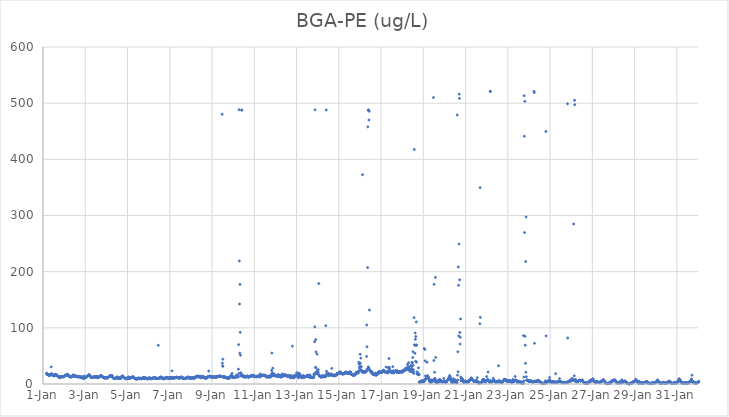
| Category | BGA-PE (ug/L) |
|---|---|
| 44927.166666666664 | 18.65 |
| 44927.177083333336 | 19.18 |
| 44927.1875 | 17.13 |
| 44927.197916666664 | 17.12 |
| 44927.208333333336 | 17.05 |
| 44927.21875 | 17.15 |
| 44927.229166666664 | 16.81 |
| 44927.239583333336 | 16.62 |
| 44927.25 | 16.88 |
| 44927.260416666664 | 15.84 |
| 44927.270833333336 | 16.1 |
| 44927.28125 | 15.01 |
| 44927.291666666664 | 15.62 |
| 44927.302083333336 | 15.47 |
| 44927.3125 | 16.09 |
| 44927.322916666664 | 15.93 |
| 44927.333333333336 | 16.45 |
| 44927.34375 | 15.95 |
| 44927.354166666664 | 16.73 |
| 44927.364583333336 | 16.29 |
| 44927.375 | 17.25 |
| 44927.385416666664 | 30.47 |
| 44927.395833333336 | 18.46 |
| 44927.40625 | 18.08 |
| 44927.416666666664 | 17.68 |
| 44927.427083333336 | 16.64 |
| 44927.4375 | 16.25 |
| 44927.447916666664 | 15.73 |
| 44927.458333333336 | 15.37 |
| 44927.46875 | 15.46 |
| 44927.479166666664 | 15.32 |
| 44927.489583333336 | 15.97 |
| 44927.5 | 15.78 |
| 44927.510416666664 | 13.98 |
| 44927.520833333336 | 15.06 |
| 44927.53125 | 15.73 |
| 44927.541666666664 | 16.14 |
| 44927.552083333336 | 15.03 |
| 44927.5625 | 16.63 |
| 44927.572916666664 | 17.08 |
| 44927.583333333336 | 16.64 |
| 44927.59375 | 17.14 |
| 44927.604166666664 | 16.59 |
| 44927.614583333336 | 15.05 |
| 44927.625 | 14.96 |
| 44927.635416666664 | 15.98 |
| 44927.645833333336 | 15.54 |
| 44927.65625 | 16.41 |
| 44927.666666666664 | 14.56 |
| 44927.677083333336 | 14.66 |
| 44927.6875 | 14.16 |
| 44927.697916666664 | 14.29 |
| 44927.708333333336 | 13.63 |
| 44927.71875 | 13.28 |
| 44927.729166666664 | 13.1 |
| 44927.739583333336 | 12.7 |
| 44927.75 | 12.32 |
| 44927.760416666664 | 12.81 |
| 44927.770833333336 | 12.31 |
| 44927.78125 | 11.78 |
| 44927.791666666664 | 12.26 |
| 44927.802083333336 | 12.34 |
| 44927.8125 | 11.03 |
| 44927.822916666664 | 12.43 |
| 44927.833333333336 | 12.68 |
| 44927.84375 | 12.93 |
| 44927.854166666664 | 12.64 |
| 44927.864583333336 | 13.13 |
| 44927.875 | 12.84 |
| 44927.885416666664 | 13.13 |
| 44927.895833333336 | 13.6 |
| 44927.90625 | 13.12 |
| 44927.916666666664 | 13.04 |
| 44927.927083333336 | 13.09 |
| 44927.9375 | 12.62 |
| 44927.947916666664 | 13.54 |
| 44927.958333333336 | 12.74 |
| 44927.96875 | 13.08 |
| 44927.979166666664 | 13.43 |
| 44927.989583333336 | 13.12 |
| 44928.0 | 12.98 |
| 44928.010416666664 | 13.39 |
| 44928.020833333336 | 14.38 |
| 44928.03125 | 14.74 |
| 44928.041666666664 | 15.17 |
| 44928.052083333336 | 15.42 |
| 44928.0625 | 15.53 |
| 44928.072916666664 | 15.32 |
| 44928.083333333336 | 15.5 |
| 44928.09375 | 15.75 |
| 44928.104166666664 | 16.1 |
| 44928.114583333336 | 16.18 |
| 44928.125 | 16.17 |
| 44928.135416666664 | 16.05 |
| 44928.145833333336 | 16.62 |
| 44928.15625 | 17.14 |
| 44928.166666666664 | 16.83 |
| 44928.177083333336 | 15.29 |
| 44928.1875 | 15.35 |
| 44928.197916666664 | 15.83 |
| 44928.208333333336 | 14.53 |
| 44928.21875 | 14.51 |
| 44928.229166666664 | 14.6 |
| 44928.239583333336 | 13.75 |
| 44928.25 | 13.94 |
| 44928.260416666664 | 13.48 |
| 44928.270833333336 | 13.48 |
| 44928.28125 | 12.92 |
| 44928.291666666664 | 12.66 |
| 44928.302083333336 | 12.52 |
| 44928.3125 | 12.59 |
| 44928.322916666664 | 12.58 |
| 44928.333333333336 | 12.89 |
| 44928.34375 | 12.43 |
| 44928.354166666664 | 13.5 |
| 44928.364583333336 | 13.8 |
| 44928.375 | 13.36 |
| 44928.385416666664 | 13.85 |
| 44928.395833333336 | 13.43 |
| 44928.40625 | 14.41 |
| 44928.416666666664 | 14.92 |
| 44928.427083333336 | 15.25 |
| 44928.4375 | 16.37 |
| 44928.447916666664 | 14 |
| 44928.458333333336 | 14.24 |
| 44928.46875 | 14.18 |
| 44928.479166666664 | 14.22 |
| 44928.489583333336 | 14.66 |
| 44928.5 | 14.39 |
| 44928.510416666664 | 14.44 |
| 44928.520833333336 | 14.01 |
| 44928.53125 | 14.05 |
| 44928.541666666664 | 13.69 |
| 44928.552083333336 | 14.08 |
| 44928.5625 | 14.39 |
| 44928.572916666664 | 13.48 |
| 44928.583333333336 | 13.37 |
| 44928.59375 | 13.19 |
| 44928.604166666664 | 13.55 |
| 44928.614583333336 | 13.35 |
| 44928.625 | 13.06 |
| 44928.635416666664 | 12.7 |
| 44928.645833333336 | 13.03 |
| 44928.65625 | 12.8 |
| 44928.666666666664 | 12.88 |
| 44928.677083333336 | 12.41 |
| 44928.6875 | 13.59 |
| 44928.697916666664 | 13.53 |
| 44928.708333333336 | 13.34 |
| 44928.71875 | 13.3 |
| 44928.729166666664 | 13.03 |
| 44928.739583333336 | 12.75 |
| 44928.75 | 12.69 |
| 44928.760416666664 | 12.42 |
| 44928.770833333336 | 12.17 |
| 44928.78125 | 12.14 |
| 44928.791666666664 | 11.85 |
| 44928.802083333336 | 12.01 |
| 44928.8125 | 12.43 |
| 44928.822916666664 | 12.39 |
| 44928.833333333336 | 11.49 |
| 44928.84375 | 12.12 |
| 44928.854166666664 | 11.93 |
| 44928.864583333336 | 12.15 |
| 44928.875 | 12.36 |
| 44928.885416666664 | 10.09 |
| 44928.895833333336 | 11.67 |
| 44928.90625 | 11.65 |
| 44928.916666666664 | 11.98 |
| 44928.927083333336 | 11.79 |
| 44928.9375 | 9.6 |
| 44928.947916666664 | 14.07 |
| 44928.958333333336 | 11.97 |
| 44928.96875 | 11.89 |
| 44928.979166666664 | 12.26 |
| 44928.989583333336 | 11.67 |
| 44929.0 | 11.66 |
| 44929.010416666664 | 11.88 |
| 44929.020833333336 | 11.72 |
| 44929.03125 | 11.85 |
| 44929.041666666664 | 11.75 |
| 44929.052083333336 | 11.65 |
| 44929.0625 | 12.62 |
| 44929.072916666664 | 13 |
| 44929.083333333336 | 13.63 |
| 44929.09375 | 14 |
| 44929.104166666664 | 14.8 |
| 44929.114583333336 | 14.39 |
| 44929.125 | 14.75 |
| 44929.135416666664 | 15.12 |
| 44929.145833333336 | 15.21 |
| 44929.15625 | 15.79 |
| 44929.166666666664 | 16.57 |
| 44929.177083333336 | 15.92 |
| 44929.1875 | 15.76 |
| 44929.197916666664 | 15.84 |
| 44929.208333333336 | 15.44 |
| 44929.21875 | 14.55 |
| 44929.229166666664 | 14.38 |
| 44929.239583333336 | 12.95 |
| 44929.25 | 13.27 |
| 44929.260416666664 | 12.44 |
| 44929.270833333336 | 12.78 |
| 44929.28125 | 12.28 |
| 44929.291666666664 | 11.9 |
| 44929.302083333336 | 11.91 |
| 44929.3125 | 11.4 |
| 44929.322916666664 | 11.84 |
| 44929.333333333336 | 11.33 |
| 44929.34375 | 11.63 |
| 44929.354166666664 | 11.66 |
| 44929.364583333336 | 11.91 |
| 44929.375 | 11.97 |
| 44929.385416666664 | 12.45 |
| 44929.395833333336 | 12.5 |
| 44929.40625 | 12.63 |
| 44929.416666666664 | 12.84 |
| 44929.427083333336 | 12.88 |
| 44929.4375 | 12.83 |
| 44929.447916666664 | 12.94 |
| 44929.458333333336 | 13.07 |
| 44929.46875 | 12.45 |
| 44929.479166666664 | 12.67 |
| 44929.489583333336 | 12.43 |
| 44929.5 | 12.8 |
| 44929.510416666664 | 12.56 |
| 44929.520833333336 | 12.25 |
| 44929.53125 | 12.21 |
| 44929.541666666664 | 12.01 |
| 44929.552083333336 | 13.2 |
| 44929.5625 | 12.09 |
| 44929.572916666664 | 13.1 |
| 44929.583333333336 | 11.37 |
| 44929.59375 | 11.45 |
| 44929.604166666664 | 11.51 |
| 44929.614583333336 | 11.57 |
| 44929.625 | 12 |
| 44929.635416666664 | 12.16 |
| 44929.645833333336 | 12.48 |
| 44929.65625 | 12.99 |
| 44929.666666666664 | 12.86 |
| 44929.677083333336 | 13.28 |
| 44929.6875 | 13.53 |
| 44929.697916666664 | 13.52 |
| 44929.708333333336 | 13.55 |
| 44929.71875 | 14.55 |
| 44929.729166666664 | 14.64 |
| 44929.739583333336 | 14.56 |
| 44929.75 | 14.76 |
| 44929.760416666664 | 14.5 |
| 44929.770833333336 | 14.5 |
| 44929.78125 | 13.82 |
| 44929.791666666664 | 13.13 |
| 44929.802083333336 | 12.77 |
| 44929.8125 | 12.68 |
| 44929.822916666664 | 12.5 |
| 44929.833333333336 | 12.38 |
| 44929.84375 | 12.14 |
| 44929.854166666664 | 11.52 |
| 44929.864583333336 | 11.76 |
| 44929.875 | 11.9 |
| 44929.885416666664 | 11.18 |
| 44929.895833333336 | 10.81 |
| 44929.90625 | 10.63 |
| 44929.916666666664 | 10.57 |
| 44929.927083333336 | 10.64 |
| 44929.9375 | 11.1 |
| 44929.947916666664 | 11.24 |
| 44929.958333333336 | 11.08 |
| 44929.96875 | 11.15 |
| 44929.979166666664 | 10.8 |
| 44929.989583333336 | 11.62 |
| 44930.0 | 10.84 |
| 44930.010416666664 | 10.91 |
| 44930.020833333336 | 11.46 |
| 44930.03125 | 11.16 |
| 44930.041666666664 | 10.99 |
| 44930.052083333336 | 11.11 |
| 44930.0625 | 11.25 |
| 44930.072916666664 | 11.15 |
| 44930.083333333336 | 11.06 |
| 44930.09375 | 11.92 |
| 44930.104166666664 | 12.62 |
| 44930.114583333336 | 12.88 |
| 44930.125 | 13.44 |
| 44930.135416666664 | 13.64 |
| 44930.145833333336 | 13.6 |
| 44930.15625 | 13.91 |
| 44930.166666666664 | 14.1 |
| 44930.177083333336 | 14.34 |
| 44930.1875 | 14.69 |
| 44930.197916666664 | 14.5 |
| 44930.208333333336 | 14.82 |
| 44930.21875 | 14.65 |
| 44930.229166666664 | 14.37 |
| 44930.239583333336 | 14.43 |
| 44930.25 | 15.09 |
| 44930.260416666664 | 14.45 |
| 44930.270833333336 | 14.56 |
| 44930.28125 | 13.86 |
| 44930.291666666664 | 12.07 |
| 44930.302083333336 | 12.21 |
| 44930.3125 | 11.21 |
| 44930.322916666664 | 10.42 |
| 44930.333333333336 | 10.98 |
| 44930.34375 | 10.54 |
| 44930.354166666664 | 10.15 |
| 44930.364583333336 | 9.94 |
| 44930.375 | 9.74 |
| 44930.385416666664 | 9.69 |
| 44930.395833333336 | 9.86 |
| 44930.40625 | 9.99 |
| 44930.416666666664 | 9.71 |
| 44930.427083333336 | 10.22 |
| 44930.4375 | 10.28 |
| 44930.447916666664 | 10.83 |
| 44930.458333333336 | 10.68 |
| 44930.46875 | 10.94 |
| 44930.479166666664 | 11.15 |
| 44930.489583333336 | 11.3 |
| 44930.5 | 11.19 |
| 44930.510416666664 | 12.93 |
| 44930.520833333336 | 10.7 |
| 44930.53125 | 10.33 |
| 44930.541666666664 | 10.33 |
| 44930.552083333336 | 10.09 |
| 44930.5625 | 10.08 |
| 44930.572916666664 | 9.81 |
| 44930.583333333336 | 10.77 |
| 44930.59375 | 11 |
| 44930.604166666664 | 10.67 |
| 44930.614583333336 | 10.29 |
| 44930.625 | 9.86 |
| 44930.635416666664 | 10.16 |
| 44930.645833333336 | 9.82 |
| 44930.65625 | 11.32 |
| 44930.666666666664 | 11.47 |
| 44930.677083333336 | 11.46 |
| 44930.6875 | 12.46 |
| 44930.697916666664 | 10.06 |
| 44930.708333333336 | 12.18 |
| 44930.71875 | 12.79 |
| 44930.729166666664 | 13.2 |
| 44930.739583333336 | 13.8 |
| 44930.75 | 14.16 |
| 44930.760416666664 | 14.11 |
| 44930.770833333336 | 13.6 |
| 44930.78125 | 14.07 |
| 44930.791666666664 | 12.73 |
| 44930.802083333336 | 12.24 |
| 44930.8125 | 12.52 |
| 44930.822916666664 | 12.12 |
| 44930.833333333336 | 11.13 |
| 44930.84375 | 11.56 |
| 44930.854166666664 | 10.7 |
| 44930.864583333336 | 10.63 |
| 44930.875 | 10.43 |
| 44930.885416666664 | 9.65 |
| 44930.895833333336 | 9.45 |
| 44930.90625 | 9.7 |
| 44930.916666666664 | 9.24 |
| 44930.927083333336 | 9.63 |
| 44930.9375 | 9.63 |
| 44930.947916666664 | 9.35 |
| 44930.958333333336 | 9.89 |
| 44930.96875 | 10.23 |
| 44930.979166666664 | 10.61 |
| 44930.989583333336 | 10.5 |
| 44931.0 | 11.18 |
| 44931.010416666664 | 11.52 |
| 44931.020833333336 | 11.4 |
| 44931.03125 | 10.01 |
| 44931.041666666664 | 10.48 |
| 44931.052083333336 | 12.75 |
| 44931.0625 | 10.58 |
| 44931.072916666664 | 9.98 |
| 44931.083333333336 | 10.04 |
| 44931.09375 | 10.29 |
| 44931.104166666664 | 10.04 |
| 44931.114583333336 | 10.26 |
| 44931.125 | 10.12 |
| 44931.135416666664 | 10.93 |
| 44931.145833333336 | 11.42 |
| 44931.15625 | 11.7 |
| 44931.166666666664 | 11.46 |
| 44931.177083333336 | 11.76 |
| 44931.1875 | 11.46 |
| 44931.197916666664 | 11.95 |
| 44931.208333333336 | 11.65 |
| 44931.21875 | 11.89 |
| 44931.229166666664 | 11.74 |
| 44931.239583333336 | 12.06 |
| 44931.25 | 12.65 |
| 44931.260416666664 | 12.99 |
| 44931.270833333336 | 11.47 |
| 44931.28125 | 11.89 |
| 44931.291666666664 | 11.55 |
| 44931.302083333336 | 11.45 |
| 44931.3125 | 11.28 |
| 44931.322916666664 | 10.49 |
| 44931.333333333336 | 10.36 |
| 44931.34375 | 10.28 |
| 44931.354166666664 | 9.99 |
| 44931.364583333336 | 9.38 |
| 44931.375 | 9.33 |
| 44931.385416666664 | 9.27 |
| 44931.395833333336 | 9.37 |
| 44931.40625 | 9.22 |
| 44931.416666666664 | 9.1 |
| 44931.427083333336 | 9.3 |
| 44931.4375 | 8.99 |
| 44931.447916666664 | 9.35 |
| 44931.458333333336 | 9.17 |
| 44931.46875 | 9.28 |
| 44931.479166666664 | 9.41 |
| 44931.489583333336 | 9.56 |
| 44931.5 | 9.97 |
| 44931.510416666664 | 10.32 |
| 44931.520833333336 | 10.3 |
| 44931.53125 | 10.68 |
| 44931.541666666664 | 9.69 |
| 44931.552083333336 | 9.88 |
| 44931.5625 | 9.61 |
| 44931.572916666664 | 10.37 |
| 44931.583333333336 | 9.34 |
| 44931.59375 | 9.29 |
| 44931.604166666664 | 9.56 |
| 44931.614583333336 | 9.8 |
| 44931.625 | 10.14 |
| 44931.635416666664 | 10.13 |
| 44931.645833333336 | 9.88 |
| 44931.65625 | 9.86 |
| 44931.666666666664 | 9.37 |
| 44931.677083333336 | 10.03 |
| 44931.6875 | 9.9 |
| 44931.697916666664 | 10.23 |
| 44931.708333333336 | 11 |
| 44931.71875 | 10.71 |
| 44931.729166666664 | 10.02 |
| 44931.739583333336 | 10.62 |
| 44931.75 | 11.11 |
| 44931.760416666664 | 10.81 |
| 44931.770833333336 | 11.48 |
| 44931.78125 | 11.94 |
| 44931.791666666664 | 9.79 |
| 44931.802083333336 | 10.89 |
| 44931.8125 | 11.39 |
| 44931.822916666664 | 10.62 |
| 44931.833333333336 | 10.34 |
| 44931.84375 | 10.51 |
| 44931.854166666664 | 10.26 |
| 44931.864583333336 | 9.93 |
| 44931.875 | 9.98 |
| 44931.885416666664 | 10.89 |
| 44931.895833333336 | 9.63 |
| 44931.90625 | 9.62 |
| 44931.916666666664 | 9.37 |
| 44931.927083333336 | 9.34 |
| 44931.9375 | 9.47 |
| 44931.947916666664 | 9.32 |
| 44931.958333333336 | 9.08 |
| 44931.96875 | 9.53 |
| 44931.979166666664 | 9.59 |
| 44931.989583333336 | 9.61 |
| 44932.0 | 9.58 |
| 44932.010416666664 | 9.74 |
| 44932.020833333336 | 9.93 |
| 44932.03125 | 11.76 |
| 44932.041666666664 | 10.85 |
| 44932.052083333336 | 11 |
| 44932.0625 | 10.15 |
| 44932.072916666664 | 9.64 |
| 44932.083333333336 | 9.58 |
| 44932.09375 | 9.47 |
| 44932.104166666664 | 10.23 |
| 44932.114583333336 | 9.96 |
| 44932.125 | 9.87 |
| 44932.135416666664 | 9.77 |
| 44932.145833333336 | 9.43 |
| 44932.15625 | 9.2 |
| 44932.166666666664 | 9.84 |
| 44932.177083333336 | 10.23 |
| 44932.1875 | 10.1 |
| 44932.197916666664 | 10.39 |
| 44932.208333333336 | 10.45 |
| 44932.21875 | 10.41 |
| 44932.229166666664 | 10.84 |
| 44932.239583333336 | 10.77 |
| 44932.25 | 11.01 |
| 44932.260416666664 | 11.08 |
| 44932.270833333336 | 11.06 |
| 44932.28125 | 11.5 |
| 44932.291666666664 | 11.24 |
| 44932.302083333336 | 10.51 |
| 44932.3125 | 11 |
| 44932.322916666664 | 10.38 |
| 44932.333333333336 | 10.35 |
| 44932.34375 | 9.96 |
| 44932.354166666664 | 9.74 |
| 44932.364583333336 | 10.1 |
| 44932.375 | 10.27 |
| 44932.385416666664 | 10.02 |
| 44932.395833333336 | 9.88 |
| 44932.40625 | 9.71 |
| 44932.416666666664 | 9.74 |
| 44932.427083333336 | 9.87 |
| 44932.4375 | 9.82 |
| 44932.447916666664 | 9.95 |
| 44932.458333333336 | 68.88 |
| 44932.46875 | 9.67 |
| 44932.479166666664 | 9.9 |
| 44932.489583333336 | 10.68 |
| 44932.5 | 10.95 |
| 44932.510416666664 | 10.69 |
| 44932.520833333336 | 11.08 |
| 44932.53125 | 11.41 |
| 44932.541666666664 | 10.44 |
| 44932.552083333336 | 12.23 |
| 44932.5625 | 11.37 |
| 44932.572916666664 | 11.58 |
| 44932.583333333336 | 12.57 |
| 44932.59375 | 11.5 |
| 44932.604166666664 | 11.74 |
| 44932.614583333336 | 11.14 |
| 44932.625 | 10.64 |
| 44932.635416666664 | 11.02 |
| 44932.645833333336 | 11.28 |
| 44932.65625 | 9.57 |
| 44932.666666666664 | 9.62 |
| 44932.677083333336 | 9.49 |
| 44932.6875 | 9.34 |
| 44932.697916666664 | 9.83 |
| 44932.708333333336 | 10.7 |
| 44932.71875 | 9.45 |
| 44932.729166666664 | 10.16 |
| 44932.739583333336 | 9.05 |
| 44932.75 | 10.1 |
| 44932.760416666664 | 9.62 |
| 44932.770833333336 | 10.29 |
| 44932.78125 | 10.84 |
| 44932.791666666664 | 10.54 |
| 44932.802083333336 | 9.97 |
| 44932.8125 | 11.53 |
| 44932.822916666664 | 11.5 |
| 44932.833333333336 | 11.83 |
| 44932.84375 | 11.5 |
| 44932.854166666664 | 11.62 |
| 44932.864583333336 | 11.36 |
| 44932.875 | 10.55 |
| 44932.885416666664 | 10.57 |
| 44932.895833333336 | 10.41 |
| 44932.90625 | 10.26 |
| 44932.916666666664 | 10.69 |
| 44932.927083333336 | 10.48 |
| 44932.9375 | 10.85 |
| 44932.947916666664 | 10.55 |
| 44932.958333333336 | 10.57 |
| 44932.96875 | 10.48 |
| 44932.979166666664 | 10.23 |
| 44932.989583333336 | 10.22 |
| 44933.0 | 11.3 |
| 44933.010416666664 | 9.99 |
| 44933.020833333336 | 10.05 |
| 44933.03125 | 10.73 |
| 44933.041666666664 | 10.21 |
| 44933.052083333336 | 10.26 |
| 44933.0625 | 11.02 |
| 44933.072916666664 | 11.85 |
| 44933.083333333336 | 10.81 |
| 44933.09375 | 10.68 |
| 44933.104166666664 | 23.41 |
| 44933.114583333336 | 10.53 |
| 44933.125 | 10.27 |
| 44933.135416666664 | 10.42 |
| 44933.145833333336 | 10.54 |
| 44933.15625 | 10.72 |
| 44933.166666666664 | 10.44 |
| 44933.177083333336 | 10.63 |
| 44933.1875 | 10.47 |
| 44933.197916666664 | 11.9 |
| 44933.208333333336 | 10.75 |
| 44933.21875 | 11.08 |
| 44933.229166666664 | 11.3 |
| 44933.239583333336 | 11.23 |
| 44933.25 | 11.56 |
| 44933.260416666664 | 11.5 |
| 44933.270833333336 | 11.04 |
| 44933.28125 | 11.39 |
| 44933.291666666664 | 11.32 |
| 44933.302083333336 | 11.59 |
| 44933.3125 | 12.26 |
| 44933.322916666664 | 12.1 |
| 44933.333333333336 | 11.73 |
| 44933.34375 | 11.61 |
| 44933.354166666664 | 11.32 |
| 44933.364583333336 | 11.28 |
| 44933.375 | 11.38 |
| 44933.385416666664 | 11.11 |
| 44933.395833333336 | 11.18 |
| 44933.40625 | 11.06 |
| 44933.416666666664 | 10.92 |
| 44933.427083333336 | 10.94 |
| 44933.4375 | 10.95 |
| 44933.447916666664 | 10.56 |
| 44933.458333333336 | 10.49 |
| 44933.46875 | 10.66 |
| 44933.479166666664 | 10.98 |
| 44933.489583333336 | 11.05 |
| 44933.5 | 11.82 |
| 44933.510416666664 | 12 |
| 44933.520833333336 | 11.14 |
| 44933.53125 | 11.88 |
| 44933.541666666664 | 12.01 |
| 44933.552083333336 | 12.55 |
| 44933.5625 | 11.25 |
| 44933.572916666664 | 11.86 |
| 44933.583333333336 | 11.98 |
| 44933.59375 | 10.25 |
| 44933.604166666664 | 11.23 |
| 44933.614583333336 | 9.79 |
| 44933.625 | 10.88 |
| 44933.635416666664 | 10.23 |
| 44933.645833333336 | 10.33 |
| 44933.65625 | 10.01 |
| 44933.666666666664 | 9.85 |
| 44933.677083333336 | 10.08 |
| 44933.6875 | 9.85 |
| 44933.697916666664 | 9.57 |
| 44933.708333333336 | 10.02 |
| 44933.71875 | 9.97 |
| 44933.729166666664 | 9.85 |
| 44933.739583333336 | 9.92 |
| 44933.75 | 10.29 |
| 44933.760416666664 | 10.21 |
| 44933.770833333336 | 10.09 |
| 44933.78125 | 10.63 |
| 44933.791666666664 | 10.54 |
| 44933.802083333336 | 10.43 |
| 44933.8125 | 10.68 |
| 44933.822916666664 | 11.04 |
| 44933.833333333336 | 11.68 |
| 44933.84375 | 12.61 |
| 44933.854166666664 | 12.12 |
| 44933.864583333336 | 11.76 |
| 44933.875 | 12.01 |
| 44933.885416666664 | 11.54 |
| 44933.895833333336 | 11.61 |
| 44933.90625 | 10.16 |
| 44933.916666666664 | 11.1 |
| 44933.927083333336 | 11.08 |
| 44933.9375 | 10.94 |
| 44933.947916666664 | 11.31 |
| 44933.958333333336 | 11.4 |
| 44933.96875 | 10.93 |
| 44933.979166666664 | 9.95 |
| 44933.989583333336 | 10.8 |
| 44934.0 | 10.9 |
| 44934.010416666664 | 10.69 |
| 44934.020833333336 | 10.72 |
| 44934.03125 | 10.7 |
| 44934.041666666664 | 10.73 |
| 44934.052083333336 | 10.46 |
| 44934.0625 | 11.21 |
| 44934.072916666664 | 11.21 |
| 44934.083333333336 | 11.14 |
| 44934.09375 | 11.4 |
| 44934.104166666664 | 11.46 |
| 44934.114583333336 | 10.83 |
| 44934.125 | 10.55 |
| 44934.135416666664 | 10.64 |
| 44934.145833333336 | 9.33 |
| 44934.15625 | 11.44 |
| 44934.166666666664 | 11.28 |
| 44934.177083333336 | 11.94 |
| 44934.1875 | 11.57 |
| 44934.197916666664 | 11.54 |
| 44934.208333333336 | 12.08 |
| 44934.21875 | 12.24 |
| 44934.229166666664 | 12.19 |
| 44934.239583333336 | 13.28 |
| 44934.25 | 12.68 |
| 44934.260416666664 | 12.92 |
| 44934.270833333336 | 13.02 |
| 44934.28125 | 12.95 |
| 44934.291666666664 | 12.84 |
| 44934.302083333336 | 12.75 |
| 44934.3125 | 13.02 |
| 44934.322916666664 | 13.96 |
| 44934.333333333336 | 14.58 |
| 44934.34375 | 13.38 |
| 44934.354166666664 | 13.44 |
| 44934.364583333336 | 13.08 |
| 44934.375 | 12.81 |
| 44934.385416666664 | 12.89 |
| 44934.395833333336 | 13.52 |
| 44934.40625 | 12.88 |
| 44934.416666666664 | 12.4 |
| 44934.427083333336 | 12.45 |
| 44934.4375 | 13.96 |
| 44934.447916666664 | 12.26 |
| 44934.458333333336 | 12.17 |
| 44934.46875 | 12.06 |
| 44934.479166666664 | 11.61 |
| 44934.489583333336 | 11.94 |
| 44934.5 | 10.9 |
| 44934.510416666664 | 10.93 |
| 44934.520833333336 | 12.32 |
| 44934.53125 | 13.02 |
| 44934.541666666664 | 12.55 |
| 44934.552083333336 | 13.49 |
| 44934.5625 | 13.2 |
| 44934.572916666664 | 13.45 |
| 44934.583333333336 | 12.57 |
| 44934.59375 | 12.45 |
| 44934.604166666664 | 12.71 |
| 44934.614583333336 | 12.17 |
| 44934.625 | 11.53 |
| 44934.635416666664 | 11.77 |
| 44934.645833333336 | 11.46 |
| 44934.65625 | 11.88 |
| 44934.666666666664 | 11.42 |
| 44934.677083333336 | 9.81 |
| 44934.6875 | 10.68 |
| 44934.697916666664 | 11.47 |
| 44934.708333333336 | 11.17 |
| 44934.71875 | 10.89 |
| 44934.729166666664 | 11.73 |
| 44934.739583333336 | 11.03 |
| 44934.75 | 10.48 |
| 44934.760416666664 | 11.23 |
| 44934.770833333336 | 11.24 |
| 44934.78125 | 12 |
| 44934.791666666664 | 13.13 |
| 44934.802083333336 | 12.79 |
| 44934.8125 | 12.93 |
| 44934.822916666664 | 13.21 |
| 44934.833333333336 | 12.72 |
| 44934.84375 | 22.98 |
| 44934.854166666664 | 12.93 |
| 44934.864583333336 | 13.2 |
| 44934.875 | 13.52 |
| 44934.885416666664 | 14.04 |
| 44934.895833333336 | 13.44 |
| 44934.90625 | 13.79 |
| 44934.916666666664 | 13.22 |
| 44934.927083333336 | 12.58 |
| 44934.9375 | 12.87 |
| 44934.947916666664 | 12.92 |
| 44934.958333333336 | 12.14 |
| 44934.96875 | 13.23 |
| 44934.979166666664 | 12.11 |
| 44934.989583333336 | 12.3 |
| 44935.0 | 12.84 |
| 44935.010416666664 | 12.09 |
| 44935.020833333336 | 12.89 |
| 44935.03125 | 13.07 |
| 44935.041666666664 | 12.21 |
| 44935.052083333336 | 12.22 |
| 44935.0625 | 12.17 |
| 44935.072916666664 | 12.02 |
| 44935.083333333336 | 12.65 |
| 44935.09375 | 12.6 |
| 44935.104166666664 | 12.93 |
| 44935.114583333336 | 12.62 |
| 44935.125 | 12.83 |
| 44935.135416666664 | 12.15 |
| 44935.145833333336 | 12.09 |
| 44935.15625 | 12.25 |
| 44935.166666666664 | 12.08 |
| 44935.177083333336 | 12.23 |
| 44935.1875 | 11.88 |
| 44935.197916666664 | 12.71 |
| 44935.208333333336 | 13.03 |
| 44935.21875 | 13.05 |
| 44935.229166666664 | 13.34 |
| 44935.239583333336 | 12.55 |
| 44935.25 | 13 |
| 44935.260416666664 | 13.2 |
| 44935.270833333336 | 13.52 |
| 44935.28125 | 13.32 |
| 44935.291666666664 | 13.71 |
| 44935.302083333336 | 13.59 |
| 44935.3125 | 13.15 |
| 44935.322916666664 | 13.73 |
| 44935.333333333336 | 13.8 |
| 44935.34375 | 14.03 |
| 44935.354166666664 | 13.81 |
| 44935.364583333336 | 14.17 |
| 44935.375 | 13.73 |
| 44935.385416666664 | 13.77 |
| 44935.395833333336 | 13.96 |
| 44935.40625 | 13.66 |
| 44935.416666666664 | 13.52 |
| 44935.427083333336 | 12.9 |
| 44935.4375 | 13.13 |
| 44935.447916666664 | 13.08 |
| 44935.458333333336 | 13.01 |
| 44935.46875 | 12.99 |
| 44935.479166666664 | 480.24 |
| 44935.489583333336 | 36.94 |
| 44935.5 | 32.15 |
| 44935.510416666664 | 44.05 |
| 44935.520833333336 | 31.55 |
| 44935.53125 | 13.49 |
| 44935.541666666664 | 12 |
| 44935.552083333336 | 11.96 |
| 44935.5625 | 12.42 |
| 44935.572916666664 | 11.48 |
| 44935.583333333336 | 13.13 |
| 44935.59375 | 13.11 |
| 44935.604166666664 | 12.68 |
| 44935.614583333336 | 11.82 |
| 44935.625 | 11.77 |
| 44935.635416666664 | 11.6 |
| 44935.645833333336 | 11.26 |
| 44935.65625 | 11.48 |
| 44935.666666666664 | 11.38 |
| 44935.677083333336 | 11.75 |
| 44935.6875 | 10.83 |
| 44935.697916666664 | 10.74 |
| 44935.708333333336 | 11.07 |
| 44935.71875 | 10.81 |
| 44935.729166666664 | 10.17 |
| 44935.739583333336 | 10.41 |
| 44935.75 | 10.55 |
| 44935.760416666664 | 10.54 |
| 44935.770833333336 | 10.88 |
| 44935.78125 | 10.51 |
| 44935.791666666664 | 10.49 |
| 44935.802083333336 | 10.47 |
| 44935.8125 | 10.96 |
| 44935.822916666664 | 11.31 |
| 44935.833333333336 | 11.39 |
| 44935.84375 | 12.22 |
| 44935.854166666664 | 12.77 |
| 44935.864583333336 | 12.97 |
| 44935.875 | 13.14 |
| 44935.885416666664 | 13.32 |
| 44935.895833333336 | 13.58 |
| 44935.90625 | 12.6 |
| 44935.916666666664 | 16.3 |
| 44935.927083333336 | 13.85 |
| 44935.9375 | 14.51 |
| 44935.947916666664 | 18.86 |
| 44935.958333333336 | 13.12 |
| 44935.96875 | 11.98 |
| 44935.979166666664 | 11.93 |
| 44935.989583333336 | 12.66 |
| 44936.0 | 11.88 |
| 44936.010416666664 | 11.86 |
| 44936.020833333336 | 12.32 |
| 44936.03125 | 11.68 |
| 44936.041666666664 | 12.17 |
| 44936.052083333336 | 11.74 |
| 44936.0625 | 11.82 |
| 44936.072916666664 | 11.48 |
| 44936.083333333336 | 11.8 |
| 44936.09375 | 11.89 |
| 44936.104166666664 | 12.55 |
| 44936.114583333336 | 12.92 |
| 44936.125 | 12.55 |
| 44936.135416666664 | 13.42 |
| 44936.145833333336 | 14.51 |
| 44936.15625 | 15.09 |
| 44936.166666666664 | 15.83 |
| 44936.177083333336 | 12.77 |
| 44936.1875 | 12.86 |
| 44936.197916666664 | 12.89 |
| 44936.208333333336 | 13.61 |
| 44936.21875 | 12.25 |
| 44936.229166666664 | 12.68 |
| 44936.239583333336 | 13.03 |
| 44936.25 | 26.39 |
| 44936.260416666664 | 70.12 |
| 44936.270833333336 | 18.69 |
| 44936.28125 | 488.32 |
| 44936.291666666664 | 219.14 |
| 44936.302083333336 | 142.41 |
| 44936.3125 | 54.92 |
| 44936.322916666664 | 177.37 |
| 44936.333333333336 | 91.98 |
| 44936.34375 | 51.21 |
| 44936.354166666664 | 14.62 |
| 44936.364583333336 | 20.11 |
| 44936.375 | 18.87 |
| 44936.385416666664 | 15.91 |
| 44936.395833333336 | 14.72 |
| 44936.40625 | 487.56 |
| 44936.416666666664 | 487.64 |
| 44936.427083333336 | 14.01 |
| 44936.4375 | 14.17 |
| 44936.447916666664 | 14.03 |
| 44936.458333333336 | 13.63 |
| 44936.46875 | 14.27 |
| 44936.479166666664 | 13.24 |
| 44936.489583333336 | 13.74 |
| 44936.5 | 14.99 |
| 44936.510416666664 | 13.62 |
| 44936.520833333336 | 12.28 |
| 44936.53125 | 13.38 |
| 44936.541666666664 | 13.67 |
| 44936.552083333336 | 13.71 |
| 44936.5625 | 12.6 |
| 44936.572916666664 | 12.79 |
| 44936.583333333336 | 12.2 |
| 44936.59375 | 13.18 |
| 44936.604166666664 | 12.6 |
| 44936.614583333336 | 13 |
| 44936.625 | 12.82 |
| 44936.635416666664 | 13.28 |
| 44936.645833333336 | 13.27 |
| 44936.65625 | 14.34 |
| 44936.666666666664 | 13.92 |
| 44936.677083333336 | 13.95 |
| 44936.6875 | 13.58 |
| 44936.697916666664 | 12.91 |
| 44936.708333333336 | 12.05 |
| 44936.71875 | 11.93 |
| 44936.729166666664 | 12.95 |
| 44936.739583333336 | 12.4 |
| 44936.75 | 13.9 |
| 44936.760416666664 | 13.55 |
| 44936.770833333336 | 13.09 |
| 44936.78125 | 12.79 |
| 44936.791666666664 | 13.02 |
| 44936.802083333336 | 13.4 |
| 44936.8125 | 13.87 |
| 44936.822916666664 | 14.16 |
| 44936.833333333336 | 14.16 |
| 44936.84375 | 13.85 |
| 44936.854166666664 | 14.86 |
| 44936.864583333336 | 14.82 |
| 44936.875 | 14.96 |
| 44936.885416666664 | 14.77 |
| 44936.895833333336 | 15.17 |
| 44936.90625 | 15.69 |
| 44936.916666666664 | 14.73 |
| 44936.927083333336 | 14.32 |
| 44936.9375 | 14.31 |
| 44936.947916666664 | 14.68 |
| 44936.958333333336 | 14.3 |
| 44936.96875 | 14.46 |
| 44936.979166666664 | 14.49 |
| 44936.989583333336 | 13.71 |
| 44937.0 | 14.17 |
| 44937.010416666664 | 14.06 |
| 44937.020833333336 | 13.27 |
| 44937.03125 | 13.24 |
| 44937.041666666664 | 13.69 |
| 44937.052083333336 | 13.03 |
| 44937.0625 | 13.49 |
| 44937.072916666664 | 13 |
| 44937.083333333336 | 12.75 |
| 44937.09375 | 12.74 |
| 44937.104166666664 | 13.05 |
| 44937.114583333336 | 13.16 |
| 44937.125 | 13.48 |
| 44937.135416666664 | 13.2 |
| 44937.145833333336 | 13.32 |
| 44937.15625 | 13.51 |
| 44937.166666666664 | 13.69 |
| 44937.177083333336 | 14.24 |
| 44937.1875 | 14.5 |
| 44937.197916666664 | 13.32 |
| 44937.208333333336 | 13.38 |
| 44937.21875 | 13.3 |
| 44937.229166666664 | 14.18 |
| 44937.239583333336 | 13.49 |
| 44937.25 | 13.45 |
| 44937.260416666664 | 13.28 |
| 44937.270833333336 | 12.24 |
| 44937.28125 | 17.88 |
| 44937.291666666664 | 13.52 |
| 44937.302083333336 | 14.57 |
| 44937.3125 | 14.7 |
| 44937.322916666664 | 14.97 |
| 44937.333333333336 | 15.06 |
| 44937.34375 | 15.31 |
| 44937.354166666664 | 15 |
| 44937.364583333336 | 15.06 |
| 44937.375 | 15.07 |
| 44937.385416666664 | 15.64 |
| 44937.395833333336 | 15.63 |
| 44937.40625 | 15.82 |
| 44937.416666666664 | 15.59 |
| 44937.427083333336 | 15.18 |
| 44937.4375 | 15.52 |
| 44937.447916666664 | 14.9 |
| 44937.458333333336 | 14.78 |
| 44937.46875 | 14.87 |
| 44937.479166666664 | 16.16 |
| 44937.489583333336 | 14.41 |
| 44937.5 | 15.16 |
| 44937.510416666664 | 15.09 |
| 44937.520833333336 | 14.81 |
| 44937.53125 | 14.85 |
| 44937.541666666664 | 14.39 |
| 44937.552083333336 | 14.64 |
| 44937.5625 | 13.54 |
| 44937.572916666664 | 13.56 |
| 44937.583333333336 | 12.68 |
| 44937.59375 | 12.42 |
| 44937.604166666664 | 12.3 |
| 44937.614583333336 | 12.5 |
| 44937.625 | 12.79 |
| 44937.635416666664 | 13.11 |
| 44937.645833333336 | 13.25 |
| 44937.65625 | 12.99 |
| 44937.666666666664 | 13.1 |
| 44937.677083333336 | 13.68 |
| 44937.6875 | 12.64 |
| 44937.697916666664 | 13.95 |
| 44937.708333333336 | 13.06 |
| 44937.71875 | 12.43 |
| 44937.729166666664 | 12.49 |
| 44937.739583333336 | 13.65 |
| 44937.75 | 13.63 |
| 44937.760416666664 | 12.85 |
| 44937.770833333336 | 12.37 |
| 44937.78125 | 16.36 |
| 44937.791666666664 | 14.66 |
| 44937.802083333336 | 14.86 |
| 44937.8125 | 14.3 |
| 44937.822916666664 | 24.17 |
| 44937.833333333336 | 55.1 |
| 44937.84375 | 14.47 |
| 44937.854166666664 | 19.16 |
| 44937.864583333336 | 19.75 |
| 44937.875 | 28.2 |
| 44937.885416666664 | 15.42 |
| 44937.895833333336 | 15.06 |
| 44937.90625 | 15.23 |
| 44937.916666666664 | 15.72 |
| 44937.927083333336 | 14.66 |
| 44937.9375 | 16.13 |
| 44937.947916666664 | 17.5 |
| 44937.958333333336 | 15.52 |
| 44937.96875 | 15.32 |
| 44937.979166666664 | 15.06 |
| 44937.989583333336 | 14.83 |
| 44938.0 | 14.61 |
| 44938.010416666664 | 14.9 |
| 44938.020833333336 | 14.72 |
| 44938.03125 | 14.32 |
| 44938.041666666664 | 14.16 |
| 44938.052083333336 | 14.13 |
| 44938.0625 | 14.31 |
| 44938.072916666664 | 14.13 |
| 44938.083333333336 | 14.64 |
| 44938.09375 | 13.89 |
| 44938.104166666664 | 13.67 |
| 44938.114583333336 | 13.96 |
| 44938.125 | 14.02 |
| 44938.135416666664 | 17 |
| 44938.145833333336 | 13.71 |
| 44938.15625 | 14.22 |
| 44938.166666666664 | 13.63 |
| 44938.177083333336 | 13.63 |
| 44938.1875 | 14.6 |
| 44938.197916666664 | 14.33 |
| 44938.208333333336 | 15.01 |
| 44938.21875 | 13.79 |
| 44938.229166666664 | 13.66 |
| 44938.239583333336 | 14.51 |
| 44938.25 | 12.04 |
| 44938.260416666664 | 14.25 |
| 44938.270833333336 | 13.87 |
| 44938.28125 | 12.94 |
| 44938.291666666664 | 13.74 |
| 44938.302083333336 | 13.03 |
| 44938.3125 | 14.66 |
| 44938.322916666664 | 18.04 |
| 44938.333333333336 | 14.78 |
| 44938.34375 | 14.92 |
| 44938.354166666664 | 14.58 |
| 44938.364583333336 | 14.35 |
| 44938.375 | 14.83 |
| 44938.385416666664 | 15.26 |
| 44938.395833333336 | 14.65 |
| 44938.40625 | 14.85 |
| 44938.416666666664 | 15.29 |
| 44938.427083333336 | 14.68 |
| 44938.4375 | 15.06 |
| 44938.447916666664 | 17.3 |
| 44938.458333333336 | 15.3 |
| 44938.46875 | 15.59 |
| 44938.479166666664 | 15.22 |
| 44938.489583333336 | 14.87 |
| 44938.5 | 15.11 |
| 44938.510416666664 | 15.04 |
| 44938.520833333336 | 14.07 |
| 44938.53125 | 14.24 |
| 44938.541666666664 | 14.04 |
| 44938.552083333336 | 14.04 |
| 44938.5625 | 14.22 |
| 44938.572916666664 | 15.1 |
| 44938.583333333336 | 14.08 |
| 44938.59375 | 14.25 |
| 44938.604166666664 | 13.62 |
| 44938.614583333336 | 13.85 |
| 44938.625 | 13.93 |
| 44938.635416666664 | 14.53 |
| 44938.645833333336 | 14.31 |
| 44938.65625 | 13.3 |
| 44938.666666666664 | 13.46 |
| 44938.677083333336 | 14.16 |
| 44938.6875 | 14.97 |
| 44938.697916666664 | 13.3 |
| 44938.708333333336 | 13.84 |
| 44938.71875 | 10.68 |
| 44938.729166666664 | 13.49 |
| 44938.739583333336 | 13.54 |
| 44938.75 | 13.18 |
| 44938.760416666664 | 14.42 |
| 44938.770833333336 | 13.11 |
| 44938.78125 | 12.01 |
| 44938.791666666664 | 13.66 |
| 44938.802083333336 | 67.4 |
| 44938.8125 | 13.98 |
| 44938.822916666664 | 13.32 |
| 44938.833333333336 | 11.71 |
| 44938.84375 | 12.42 |
| 44938.854166666664 | 12.42 |
| 44938.864583333336 | 12.72 |
| 44938.875 | 10.56 |
| 44938.885416666664 | 14.48 |
| 44938.895833333336 | 14.64 |
| 44938.90625 | 13.64 |
| 44938.916666666664 | 14.29 |
| 44938.927083333336 | 14.28 |
| 44938.9375 | 14.32 |
| 44938.947916666664 | 13.63 |
| 44938.958333333336 | 14.72 |
| 44938.96875 | 13.71 |
| 44938.979166666664 | 14.84 |
| 44938.989583333336 | 15.52 |
| 44939.0 | 19.97 |
| 44939.010416666664 | 14.91 |
| 44939.020833333336 | 14.16 |
| 44939.03125 | 14.8 |
| 44939.041666666664 | 13.82 |
| 44939.052083333336 | 19.46 |
| 44939.0625 | 14.41 |
| 44939.072916666664 | 14.35 |
| 44939.083333333336 | 14.36 |
| 44939.09375 | 10.87 |
| 44939.104166666664 | 14.32 |
| 44939.114583333336 | 14.71 |
| 44939.125 | 13.71 |
| 44939.135416666664 | 18.84 |
| 44939.145833333336 | 13.93 |
| 44939.15625 | 16.73 |
| 44939.166666666664 | 14.29 |
| 44939.177083333336 | 13.53 |
| 44939.1875 | 14.27 |
| 44939.197916666664 | 13.56 |
| 44939.208333333336 | 14.3 |
| 44939.21875 | 13.27 |
| 44939.229166666664 | 13.39 |
| 44939.239583333336 | 10.99 |
| 44939.25 | 12.28 |
| 44939.260416666664 | 13.3 |
| 44939.270833333336 | 12.08 |
| 44939.28125 | 13.11 |
| 44939.291666666664 | 12.3 |
| 44939.302083333336 | 14.03 |
| 44939.3125 | 14.98 |
| 44939.322916666664 | 13.73 |
| 44939.333333333336 | 12.97 |
| 44939.34375 | 11.87 |
| 44939.354166666664 | 12.07 |
| 44939.364583333336 | 12.15 |
| 44939.375 | 12.17 |
| 44939.385416666664 | 12.95 |
| 44939.395833333336 | 13.04 |
| 44939.40625 | 13.3 |
| 44939.416666666664 | 13.12 |
| 44939.427083333336 | 13.65 |
| 44939.4375 | 13.68 |
| 44939.447916666664 | 13.4 |
| 44939.458333333336 | 13.45 |
| 44939.46875 | 13.69 |
| 44939.479166666664 | 13.53 |
| 44939.489583333336 | 13.51 |
| 44939.5 | 13.86 |
| 44939.510416666664 | 13.96 |
| 44939.520833333336 | 14.37 |
| 44939.53125 | 16.1 |
| 44939.541666666664 | 14.44 |
| 44939.552083333336 | 13.86 |
| 44939.5625 | 13.8 |
| 44939.572916666664 | 13.22 |
| 44939.583333333336 | 13.07 |
| 44939.59375 | 12.47 |
| 44939.604166666664 | 15.15 |
| 44939.614583333336 | 12.77 |
| 44939.625 | 12.83 |
| 44939.635416666664 | 16.04 |
| 44939.645833333336 | 12.01 |
| 44939.65625 | 11.94 |
| 44939.666666666664 | 13.23 |
| 44939.677083333336 | 12.32 |
| 44939.6875 | 11.84 |
| 44939.697916666664 | 12.02 |
| 44939.708333333336 | 11.72 |
| 44939.71875 | 11.83 |
| 44939.729166666664 | 11.65 |
| 44939.739583333336 | 11.36 |
| 44939.75 | 11.54 |
| 44939.760416666664 | 11.81 |
| 44939.770833333336 | 11.46 |
| 44939.78125 | 11.33 |
| 44939.791666666664 | 11.55 |
| 44939.802083333336 | 11.45 |
| 44939.8125 | 11.78 |
| 44939.822916666664 | 17.33 |
| 44939.833333333336 | 14.6 |
| 44939.84375 | 18.48 |
| 44939.854166666664 | 75.25 |
| 44939.864583333336 | 101.69 |
| 44939.875 | 488.11 |
| 44939.885416666664 | 18.48 |
| 44939.895833333336 | 29.78 |
| 44939.90625 | 79.04 |
| 44939.916666666664 | 57.09 |
| 44939.927083333336 | 28.34 |
| 44939.9375 | 21.58 |
| 44939.947916666664 | 18.76 |
| 44939.958333333336 | 22.55 |
| 44939.96875 | 53.15 |
| 44939.979166666664 | 23.33 |
| 44939.989583333336 | 18.9 |
| 44940.0 | 21.34 |
| 44940.010416666664 | 20.44 |
| 44940.020833333336 | 21.44 |
| 44940.03125 | 25.47 |
| 44940.041666666664 | 16.83 |
| 44940.052083333336 | 178.8 |
| 44940.0625 | 15.12 |
| 44940.072916666664 | 15.79 |
| 44940.083333333336 | 14.85 |
| 44940.09375 | 13.86 |
| 44940.104166666664 | 13.5 |
| 44940.114583333336 | 13.65 |
| 44940.125 | 13.26 |
| 44940.135416666664 | 12.57 |
| 44940.145833333336 | 12.99 |
| 44940.15625 | 12.9 |
| 44940.166666666664 | 12.54 |
| 44940.177083333336 | 12.83 |
| 44940.1875 | 12.51 |
| 44940.197916666664 | 12.32 |
| 44940.208333333336 | 14.93 |
| 44940.21875 | 12.56 |
| 44940.229166666664 | 13.4 |
| 44940.239583333336 | 13.16 |
| 44940.25 | 13.6 |
| 44940.260416666664 | 13.7 |
| 44940.270833333336 | 13.53 |
| 44940.28125 | 14.8 |
| 44940.291666666664 | 12.82 |
| 44940.302083333336 | 13.77 |
| 44940.3125 | 14.42 |
| 44940.322916666664 | 13.48 |
| 44940.333333333336 | 13.12 |
| 44940.34375 | 13.1 |
| 44940.354166666664 | 13.65 |
| 44940.364583333336 | 13.49 |
| 44940.375 | 12.84 |
| 44940.385416666664 | 103.81 |
| 44940.395833333336 | 14.33 |
| 44940.40625 | 487.84 |
| 44940.416666666664 | 22.79 |
| 44940.427083333336 | 18.48 |
| 44940.4375 | 17.43 |
| 44940.447916666664 | 18.16 |
| 44940.458333333336 | 16.34 |
| 44940.46875 | 16.12 |
| 44940.479166666664 | 17.3 |
| 44940.489583333336 | 17.67 |
| 44940.5 | 17.24 |
| 44940.510416666664 | 18.75 |
| 44940.520833333336 | 14.78 |
| 44940.53125 | 17.7 |
| 44940.541666666664 | 17.13 |
| 44940.552083333336 | 17.1 |
| 44940.5625 | 17.29 |
| 44940.572916666664 | 16.45 |
| 44940.583333333336 | 16.42 |
| 44940.59375 | 15.98 |
| 44940.604166666664 | 16.04 |
| 44940.614583333336 | 16.93 |
| 44940.625 | 17.45 |
| 44940.635416666664 | 16.97 |
| 44940.645833333336 | 17.7 |
| 44940.65625 | 17.07 |
| 44940.666666666664 | 27.83 |
| 44940.677083333336 | 15.22 |
| 44940.6875 | 15.76 |
| 44940.697916666664 | 15.5 |
| 44940.708333333336 | 15.52 |
| 44940.71875 | 15.05 |
| 44940.729166666664 | 15.35 |
| 44940.739583333336 | 15.15 |
| 44940.75 | 15.21 |
| 44940.760416666664 | 15.56 |
| 44940.770833333336 | 15.59 |
| 44940.78125 | 16.19 |
| 44940.791666666664 | 15.33 |
| 44940.802083333336 | 14.21 |
| 44940.8125 | 15.59 |
| 44940.822916666664 | 15.13 |
| 44940.833333333336 | 15.08 |
| 44940.84375 | 15.39 |
| 44940.854166666664 | 15.87 |
| 44940.864583333336 | 15.56 |
| 44940.875 | 15.76 |
| 44940.885416666664 | 15.78 |
| 44940.895833333336 | 16.25 |
| 44940.90625 | 16.84 |
| 44940.916666666664 | 19.23 |
| 44940.927083333336 | 18.65 |
| 44940.9375 | 18.04 |
| 44940.947916666664 | 18.4 |
| 44940.958333333336 | 18.3 |
| 44940.96875 | 18.7 |
| 44940.979166666664 | 18.75 |
| 44940.989583333336 | 18.94 |
| 44941.0 | 19.52 |
| 44941.010416666664 | 19.18 |
| 44941.020833333336 | 19.31 |
| 44941.03125 | 20.16 |
| 44941.041666666664 | 21.87 |
| 44941.052083333336 | 20.41 |
| 44941.0625 | 20.61 |
| 44941.072916666664 | 21.08 |
| 44941.083333333336 | 20.41 |
| 44941.09375 | 19.43 |
| 44941.104166666664 | 20.39 |
| 44941.114583333336 | 19.06 |
| 44941.125 | 18.99 |
| 44941.135416666664 | 18.54 |
| 44941.145833333336 | 18.78 |
| 44941.15625 | 17.89 |
| 44941.166666666664 | 18 |
| 44941.177083333336 | 17.52 |
| 44941.1875 | 17.96 |
| 44941.197916666664 | 18.56 |
| 44941.208333333336 | 18.34 |
| 44941.21875 | 18.09 |
| 44941.229166666664 | 18.4 |
| 44941.239583333336 | 18.4 |
| 44941.25 | 18.53 |
| 44941.260416666664 | 18.5 |
| 44941.270833333336 | 18.55 |
| 44941.28125 | 19.47 |
| 44941.291666666664 | 19.13 |
| 44941.302083333336 | 20.4 |
| 44941.3125 | 20.89 |
| 44941.322916666664 | 20.02 |
| 44941.333333333336 | 21.53 |
| 44941.34375 | 20.94 |
| 44941.354166666664 | 20.61 |
| 44941.364583333336 | 19.25 |
| 44941.375 | 20.18 |
| 44941.385416666664 | 20.85 |
| 44941.395833333336 | 20.22 |
| 44941.40625 | 19.53 |
| 44941.416666666664 | 19.63 |
| 44941.427083333336 | 18.49 |
| 44941.4375 | 18.97 |
| 44941.447916666664 | 18.55 |
| 44941.458333333336 | 18.81 |
| 44941.46875 | 18.83 |
| 44941.479166666664 | 18.73 |
| 44941.489583333336 | 19.55 |
| 44941.5 | 19.87 |
| 44941.510416666664 | 21.04 |
| 44941.520833333336 | 20.68 |
| 44941.53125 | 21.44 |
| 44941.541666666664 | 21.37 |
| 44941.552083333336 | 21.47 |
| 44941.5625 | 18.49 |
| 44941.572916666664 | 19.91 |
| 44941.583333333336 | 18.3 |
| 44941.59375 | 16.92 |
| 44941.604166666664 | 17.51 |
| 44941.614583333336 | 16.77 |
| 44941.625 | 16.5 |
| 44941.635416666664 | 16.71 |
| 44941.645833333336 | 16.36 |
| 44941.65625 | 16.19 |
| 44941.666666666664 | 15.81 |
| 44941.677083333336 | 16.22 |
| 44941.6875 | 15.87 |
| 44941.697916666664 | 16.2 |
| 44941.708333333336 | 15.48 |
| 44941.71875 | 15.94 |
| 44941.729166666664 | 15.57 |
| 44941.739583333336 | 15.7 |
| 44941.75 | 16.03 |
| 44941.760416666664 | 16.23 |
| 44941.770833333336 | 16.38 |
| 44941.78125 | 16.77 |
| 44941.791666666664 | 18.04 |
| 44941.802083333336 | 19.23 |
| 44941.8125 | 18.95 |
| 44941.822916666664 | 20.89 |
| 44941.833333333336 | 20.55 |
| 44941.84375 | 20.11 |
| 44941.854166666664 | 20.42 |
| 44941.864583333336 | 20.33 |
| 44941.875 | 20.72 |
| 44941.885416666664 | 20.03 |
| 44941.895833333336 | 20.28 |
| 44941.90625 | 19.55 |
| 44941.916666666664 | 21.78 |
| 44941.927083333336 | 19.66 |
| 44941.9375 | 23.14 |
| 44941.947916666664 | 38.63 |
| 44941.958333333336 | 35.32 |
| 44941.96875 | 36.44 |
| 44941.979166666664 | 28.48 |
| 44941.989583333336 | 30.6 |
| 44942.0 | 23.75 |
| 44942.010416666664 | 52.96 |
| 44942.020833333336 | 36.97 |
| 44942.03125 | 25.84 |
| 44942.041666666664 | 46.01 |
| 44942.052083333336 | 30.89 |
| 44942.0625 | 30.97 |
| 44942.072916666664 | 24.2 |
| 44942.083333333336 | 22.79 |
| 44942.09375 | 23.52 |
| 44942.104166666664 | 20.95 |
| 44942.114583333336 | 22.87 |
| 44942.125 | 372.72 |
| 44942.135416666664 | 21.87 |
| 44942.145833333336 | 21.81 |
| 44942.15625 | 21.23 |
| 44942.166666666664 | 20.96 |
| 44942.177083333336 | 21.19 |
| 44942.1875 | 21.57 |
| 44942.197916666664 | 21.34 |
| 44942.208333333336 | 21.96 |
| 44942.21875 | 21.28 |
| 44942.229166666664 | 21.61 |
| 44942.239583333336 | 21.13 |
| 44942.25 | 21.21 |
| 44942.260416666664 | 21.58 |
| 44942.270833333336 | 22.43 |
| 44942.28125 | 21.7 |
| 44942.291666666664 | 21.95 |
| 44942.302083333336 | 22.65 |
| 44942.3125 | 49.18 |
| 44942.322916666664 | 105.02 |
| 44942.333333333336 | 66.27 |
| 44942.34375 | 27.03 |
| 44942.354166666664 | 25.48 |
| 44942.364583333336 | 207.3 |
| 44942.375 | 457.8 |
| 44942.385416666664 | 487.52 |
| 44942.395833333336 | 30.49 |
| 44942.40625 | 488.11 |
| 44942.416666666664 | 28.63 |
| 44942.427083333336 | 470.04 |
| 44942.4375 | 485.51 |
| 44942.447916666664 | 131.67 |
| 44942.458333333336 | 25.87 |
| 44942.46875 | 24.91 |
| 44942.479166666664 | 23.76 |
| 44942.489583333336 | 22.72 |
| 44942.5 | 22.01 |
| 44942.510416666664 | 22.51 |
| 44942.520833333336 | 22.2 |
| 44942.53125 | 22.2 |
| 44942.541666666664 | 21.77 |
| 44942.552083333336 | 22.32 |
| 44942.5625 | 21.71 |
| 44942.572916666664 | 18.56 |
| 44942.583333333336 | 18.37 |
| 44942.59375 | 18.14 |
| 44942.604166666664 | 17.87 |
| 44942.614583333336 | 17.38 |
| 44942.625 | 18.34 |
| 44942.635416666664 | 18.42 |
| 44942.645833333336 | 17.92 |
| 44942.65625 | 17.65 |
| 44942.666666666664 | 17.29 |
| 44942.677083333336 | 17.02 |
| 44942.6875 | 16.78 |
| 44942.697916666664 | 16.81 |
| 44942.708333333336 | 16.21 |
| 44942.71875 | 16.49 |
| 44942.729166666664 | 16.15 |
| 44942.739583333336 | 19.09 |
| 44942.75 | 17.38 |
| 44942.760416666664 | 15.98 |
| 44942.770833333336 | 19 |
| 44942.78125 | 15.64 |
| 44942.791666666664 | 16.96 |
| 44942.802083333336 | 17.53 |
| 44942.8125 | 18.26 |
| 44942.822916666664 | 18.38 |
| 44942.833333333336 | 19.31 |
| 44942.84375 | 18.22 |
| 44942.854166666664 | 18.6 |
| 44942.864583333336 | 18.19 |
| 44942.875 | 21.1 |
| 44942.885416666664 | 20.15 |
| 44942.895833333336 | 20.85 |
| 44942.90625 | 22.05 |
| 44942.916666666664 | 21.83 |
| 44942.927083333336 | 21.29 |
| 44942.9375 | 21.28 |
| 44942.947916666664 | 21.23 |
| 44942.958333333336 | 21.41 |
| 44942.96875 | 21.44 |
| 44942.979166666664 | 20.92 |
| 44942.989583333336 | 20.86 |
| 44943.0 | 21.25 |
| 44943.010416666664 | 20.87 |
| 44943.020833333336 | 20.35 |
| 44943.03125 | 20.61 |
| 44943.041666666664 | 21.25 |
| 44943.052083333336 | 21.72 |
| 44943.0625 | 22.02 |
| 44943.072916666664 | 22.35 |
| 44943.083333333336 | 22.04 |
| 44943.09375 | 22.49 |
| 44943.104166666664 | 24.76 |
| 44943.114583333336 | 22.52 |
| 44943.125 | 23.83 |
| 44943.135416666664 | 23.6 |
| 44943.145833333336 | 22.9 |
| 44943.15625 | 22.72 |
| 44943.166666666664 | 22.26 |
| 44943.177083333336 | 22.68 |
| 44943.1875 | 20.88 |
| 44943.197916666664 | 22.04 |
| 44943.208333333336 | 21.33 |
| 44943.21875 | 21.43 |
| 44943.229166666664 | 21.19 |
| 44943.239583333336 | 30.2 |
| 44943.25 | 21.18 |
| 44943.260416666664 | 20.94 |
| 44943.270833333336 | 20.68 |
| 44943.28125 | 20.62 |
| 44943.291666666664 | 20.63 |
| 44943.302083333336 | 20.49 |
| 44943.3125 | 21.32 |
| 44943.322916666664 | 22.61 |
| 44943.333333333336 | 29.27 |
| 44943.34375 | 19.76 |
| 44943.354166666664 | 22.15 |
| 44943.364583333336 | 23.82 |
| 44943.375 | 45.21 |
| 44943.385416666664 | 29.66 |
| 44943.395833333336 | 27.82 |
| 44943.40625 | 24.93 |
| 44943.416666666664 | 23.01 |
| 44943.427083333336 | 22.6 |
| 44943.4375 | 22.59 |
| 44943.447916666664 | 23.69 |
| 44943.458333333336 | 22.14 |
| 44943.46875 | 21.5 |
| 44943.479166666664 | 21.73 |
| 44943.489583333336 | 20.92 |
| 44943.5 | 21.21 |
| 44943.510416666664 | 21.28 |
| 44943.520833333336 | 19.53 |
| 44943.53125 | 21.23 |
| 44943.541666666664 | 20.64 |
| 44943.552083333336 | 30.91 |
| 44943.5625 | 21.47 |
| 44943.572916666664 | 23.63 |
| 44943.583333333336 | 21.49 |
| 44943.59375 | 21.55 |
| 44943.604166666664 | 19.6 |
| 44943.614583333336 | 19.95 |
| 44943.625 | 21.13 |
| 44943.635416666664 | 22.6 |
| 44943.645833333336 | 22.31 |
| 44943.65625 | 22.42 |
| 44943.666666666664 | 22.74 |
| 44943.677083333336 | 23.18 |
| 44943.6875 | 23.28 |
| 44943.697916666664 | 23.24 |
| 44943.708333333336 | 23.33 |
| 44943.71875 | 22.8 |
| 44943.729166666664 | 22.13 |
| 44943.739583333336 | 20.85 |
| 44943.75 | 22.06 |
| 44943.760416666664 | 21.17 |
| 44943.770833333336 | 23.69 |
| 44943.78125 | 20.85 |
| 44943.791666666664 | 20.47 |
| 44943.802083333336 | 20.58 |
| 44943.8125 | 20.96 |
| 44943.822916666664 | 20.68 |
| 44943.833333333336 | 21.24 |
| 44943.84375 | 21.16 |
| 44943.854166666664 | 21.92 |
| 44943.864583333336 | 20.84 |
| 44943.875 | 20.88 |
| 44943.885416666664 | 21.32 |
| 44943.895833333336 | 21.59 |
| 44943.90625 | 22.69 |
| 44943.916666666664 | 22.26 |
| 44943.927083333336 | 21.84 |
| 44943.9375 | 21.64 |
| 44943.947916666664 | 21.87 |
| 44943.958333333336 | 21.39 |
| 44943.96875 | 21.61 |
| 44943.979166666664 | 21.32 |
| 44943.989583333336 | 20.9 |
| 44944.0 | 21.53 |
| 44944.010416666664 | 21.5 |
| 44944.020833333336 | 22.43 |
| 44944.03125 | 21.94 |
| 44944.041666666664 | 24.75 |
| 44944.052083333336 | 23.42 |
| 44944.0625 | 23.39 |
| 44944.072916666664 | 23.84 |
| 44944.083333333336 | 23.88 |
| 44944.09375 | 24.04 |
| 44944.104166666664 | 23.66 |
| 44944.114583333336 | 23.9 |
| 44944.125 | 24.75 |
| 44944.135416666664 | 26.24 |
| 44944.145833333336 | 27.12 |
| 44944.15625 | 27.36 |
| 44944.166666666664 | 26.33 |
| 44944.177083333336 | 26.29 |
| 44944.1875 | 28.7 |
| 44944.197916666664 | 26.33 |
| 44944.208333333336 | 26.13 |
| 44944.21875 | 25.87 |
| 44944.229166666664 | 25.8 |
| 44944.239583333336 | 26.62 |
| 44944.25 | 34.55 |
| 44944.260416666664 | 28.26 |
| 44944.270833333336 | 27.52 |
| 44944.28125 | 28.51 |
| 44944.291666666664 | 30.66 |
| 44944.302083333336 | 37.98 |
| 44944.3125 | 29.51 |
| 44944.322916666664 | 24.97 |
| 44944.333333333336 | 26.13 |
| 44944.34375 | 24.77 |
| 44944.354166666664 | 25.2 |
| 44944.364583333336 | 25.94 |
| 44944.375 | 22.21 |
| 44944.385416666664 | 24.26 |
| 44944.395833333336 | 23.44 |
| 44944.40625 | 32.84 |
| 44944.416666666664 | 25.44 |
| 44944.427083333336 | 22.5 |
| 44944.4375 | 27.85 |
| 44944.447916666664 | 24.43 |
| 44944.458333333336 | 37.79 |
| 44944.46875 | 31.45 |
| 44944.479166666664 | 38.57 |
| 44944.489583333336 | 21.24 |
| 44944.5 | 47.1 |
| 44944.510416666664 | 57.62 |
| 44944.520833333336 | 33.62 |
| 44944.53125 | 25.36 |
| 44944.541666666664 | 20.91 |
| 44944.552083333336 | 18.83 |
| 44944.5625 | 118.16 |
| 44944.572916666664 | 417.59 |
| 44944.583333333336 | 69.95 |
| 44944.59375 | 69.2 |
| 44944.604166666664 | 54.67 |
| 44944.614583333336 | 90.84 |
| 44944.625 | 79.57 |
| 44944.635416666664 | 40.49 |
| 44944.645833333336 | 84.58 |
| 44944.65625 | 68.42 |
| 44944.666666666664 | 110.58 |
| 44944.677083333336 | 38.84 |
| 44944.6875 | 69.5 |
| 44944.697916666664 | 21.74 |
| 44944.708333333336 | 17.76 |
| 44944.71875 | 17.62 |
| 44944.729166666664 | 18.89 |
| 44944.739583333336 | 18.13 |
| 44944.75 | 19.46 |
| 44944.760416666664 | 18.68 |
| 44944.770833333336 | 28.71 |
| 44944.78125 | 16.7 |
| 44944.791666666664 | 16.8 |
| 44944.802083333336 | 16.62 |
| 44944.8125 | 2.74 |
| 44944.822916666664 | 4.14 |
| 44944.833333333336 | 3.45 |
| 44944.84375 | 3.3 |
| 44944.854166666664 | 3.57 |
| 44944.864583333336 | 4.25 |
| 44944.875 | 4.25 |
| 44944.885416666664 | 4.03 |
| 44944.895833333336 | 4.03 |
| 44944.90625 | 3.97 |
| 44944.916666666664 | 4.1 |
| 44944.927083333336 | 4.96 |
| 44944.9375 | 6.11 |
| 44944.947916666664 | 5.19 |
| 44944.958333333336 | 5.38 |
| 44944.96875 | 4.48 |
| 44944.979166666664 | 4 |
| 44944.989583333336 | 4.08 |
| 44945.0 | 4.13 |
| 44945.010416666664 | 4.26 |
| 44945.020833333336 | 4.41 |
| 44945.03125 | 4.58 |
| 44945.041666666664 | 63.16 |
| 44945.052083333336 | 6.3 |
| 44945.0625 | 7.29 |
| 44945.072916666664 | 61.54 |
| 44945.083333333336 | 41.31 |
| 44945.09375 | 8.17 |
| 44945.104166666664 | 14.31 |
| 44945.114583333336 | 9.12 |
| 44945.125 | 9.66 |
| 44945.135416666664 | 9.62 |
| 44945.145833333336 | 9.46 |
| 44945.15625 | 10.27 |
| 44945.166666666664 | 11.73 |
| 44945.177083333336 | 38.66 |
| 44945.1875 | 14.54 |
| 44945.197916666664 | 14.72 |
| 44945.208333333336 | 12.73 |
| 44945.21875 | 12.77 |
| 44945.229166666664 | 12.15 |
| 44945.239583333336 | 11.98 |
| 44945.25 | 10.66 |
| 44945.260416666664 | 9.02 |
| 44945.270833333336 | 8.29 |
| 44945.28125 | 6.92 |
| 44945.291666666664 | 5.35 |
| 44945.302083333336 | 5.15 |
| 44945.3125 | 3.96 |
| 44945.322916666664 | 4.34 |
| 44945.333333333336 | 3.42 |
| 44945.34375 | 3.25 |
| 44945.354166666664 | 3.58 |
| 44945.364583333336 | 4.05 |
| 44945.375 | 7.42 |
| 44945.385416666664 | 3.36 |
| 44945.395833333336 | 5.02 |
| 44945.40625 | 5.18 |
| 44945.416666666664 | 5.22 |
| 44945.427083333336 | 5.31 |
| 44945.4375 | 4.87 |
| 44945.447916666664 | 5.89 |
| 44945.458333333336 | 5.21 |
| 44945.46875 | 6.25 |
| 44945.479166666664 | 510.05 |
| 44945.489583333336 | 7.51 |
| 44945.5 | 41.87 |
| 44945.510416666664 | 177.48 |
| 44945.520833333336 | 9.43 |
| 44945.53125 | 20.86 |
| 44945.541666666664 | 4.72 |
| 44945.552083333336 | 10.02 |
| 44945.5625 | 4.19 |
| 44945.572916666664 | 189.73 |
| 44945.583333333336 | 47.28 |
| 44945.59375 | 6.45 |
| 44945.604166666664 | 5.77 |
| 44945.614583333336 | 2.5 |
| 44945.625 | 2.79 |
| 44945.635416666664 | 3.32 |
| 44945.645833333336 | 4.09 |
| 44945.65625 | 2.39 |
| 44945.666666666664 | 2.14 |
| 44945.677083333336 | 3.1 |
| 44945.6875 | 4.93 |
| 44945.697916666664 | 4.59 |
| 44945.708333333336 | 5.45 |
| 44945.71875 | 3.13 |
| 44945.729166666664 | 6.45 |
| 44945.739583333336 | 6.63 |
| 44945.75 | 6.32 |
| 44945.760416666664 | 7.68 |
| 44945.770833333336 | 7.25 |
| 44945.78125 | 8 |
| 44945.791666666664 | 7.57 |
| 44945.802083333336 | 6.31 |
| 44945.8125 | 6.11 |
| 44945.822916666664 | 5.08 |
| 44945.833333333336 | 5.21 |
| 44945.84375 | 5.13 |
| 44945.854166666664 | 4.26 |
| 44945.864583333336 | 4.2 |
| 44945.875 | 4.3 |
| 44945.885416666664 | 4.09 |
| 44945.895833333336 | 3.61 |
| 44945.90625 | 4.42 |
| 44945.916666666664 | 3.58 |
| 44945.927083333336 | 3.91 |
| 44945.9375 | 4.04 |
| 44945.947916666664 | 5.18 |
| 44945.958333333336 | 4.6 |
| 44945.96875 | 9.81 |
| 44945.979166666664 | 4.86 |
| 44945.989583333336 | 4.46 |
| 44946.0 | 4.23 |
| 44946.010416666664 | 3.77 |
| 44946.020833333336 | 4.3 |
| 44946.03125 | 3.12 |
| 44946.041666666664 | 4.06 |
| 44946.052083333336 | 3.56 |
| 44946.0625 | 3.6 |
| 44946.072916666664 | 3.39 |
| 44946.083333333336 | 3.79 |
| 44946.09375 | 3.9 |
| 44946.104166666664 | 3.98 |
| 44946.114583333336 | 6.17 |
| 44946.125 | 5.91 |
| 44946.135416666664 | 6.61 |
| 44946.145833333336 | 6.86 |
| 44946.15625 | 7.31 |
| 44946.166666666664 | 7.42 |
| 44946.177083333336 | 8.66 |
| 44946.1875 | 7.84 |
| 44946.197916666664 | 8.76 |
| 44946.208333333336 | 8.64 |
| 44946.21875 | 11.68 |
| 44946.229166666664 | 13.17 |
| 44946.239583333336 | 12.04 |
| 44946.25 | 15.1 |
| 44946.260416666664 | 13.08 |
| 44946.270833333336 | 12.02 |
| 44946.28125 | 9.81 |
| 44946.291666666664 | 9.33 |
| 44946.302083333336 | 7.06 |
| 44946.3125 | 5.59 |
| 44946.322916666664 | 8.16 |
| 44946.333333333336 | 4.54 |
| 44946.34375 | 3.67 |
| 44946.354166666664 | 3.69 |
| 44946.364583333336 | 2.9 |
| 44946.375 | 3.17 |
| 44946.385416666664 | 3.07 |
| 44946.395833333336 | 3.37 |
| 44946.40625 | 3.46 |
| 44946.416666666664 | 5.99 |
| 44946.427083333336 | 9.45 |
| 44946.4375 | 3.98 |
| 44946.447916666664 | 3.6 |
| 44946.458333333336 | 3.76 |
| 44946.46875 | 3.99 |
| 44946.479166666664 | 4 |
| 44946.489583333336 | 4.33 |
| 44946.5 | 6.87 |
| 44946.510416666664 | 6.84 |
| 44946.520833333336 | 5.93 |
| 44946.53125 | 4.12 |
| 44946.541666666664 | 2.86 |
| 44946.552083333336 | 3.02 |
| 44946.5625 | 3.2 |
| 44946.572916666664 | 2.84 |
| 44946.583333333336 | 2.91 |
| 44946.59375 | 1.89 |
| 44946.604166666664 | 478.99 |
| 44946.614583333336 | 15.65 |
| 44946.625 | 7.18 |
| 44946.635416666664 | 57.31 |
| 44946.645833333336 | 21.8 |
| 44946.65625 | 208.31 |
| 44946.666666666664 | 175.68 |
| 44946.677083333336 | 85.61 |
| 44946.6875 | 249.21 |
| 44946.697916666664 | 516.08 |
| 44946.708333333336 | 508.37 |
| 44946.71875 | 185.49 |
| 44946.729166666664 | 91.82 |
| 44946.739583333336 | 71.12 |
| 44946.75 | 83.08 |
| 44946.760416666664 | 115.84 |
| 44946.770833333336 | 12.49 |
| 44946.78125 | 5.66 |
| 44946.791666666664 | 7.37 |
| 44946.802083333336 | 8.38 |
| 44946.8125 | 10.37 |
| 44946.822916666664 | 10.12 |
| 44946.833333333336 | 9.26 |
| 44946.84375 | 8.44 |
| 44946.854166666664 | 6.59 |
| 44946.864583333336 | 7.66 |
| 44946.875 | 6.68 |
| 44946.885416666664 | 4.9 |
| 44946.895833333336 | 4.11 |
| 44946.90625 | 3.7 |
| 44946.916666666664 | 3.02 |
| 44946.927083333336 | 3.29 |
| 44946.9375 | 3.75 |
| 44946.947916666664 | 3.58 |
| 44946.958333333336 | 3.9 |
| 44946.96875 | 3.57 |
| 44946.979166666664 | 4.53 |
| 44946.989583333336 | 5.62 |
| 44947.0 | 4.88 |
| 44947.010416666664 | 5.1 |
| 44947.020833333336 | 4.15 |
| 44947.03125 | 4.46 |
| 44947.041666666664 | 3.78 |
| 44947.052083333336 | 3.66 |
| 44947.0625 | 3.42 |
| 44947.072916666664 | 3.76 |
| 44947.083333333336 | 4.33 |
| 44947.09375 | 3.59 |
| 44947.104166666664 | 3.98 |
| 44947.114583333336 | 3.36 |
| 44947.125 | 3.37 |
| 44947.135416666664 | 5.47 |
| 44947.145833333336 | 4.55 |
| 44947.15625 | 4.54 |
| 44947.166666666664 | 5.89 |
| 44947.177083333336 | 6.14 |
| 44947.1875 | 6.44 |
| 44947.197916666664 | 6.95 |
| 44947.208333333336 | 7.09 |
| 44947.21875 | 7.06 |
| 44947.229166666664 | 7.64 |
| 44947.239583333336 | 8.31 |
| 44947.25 | 9.19 |
| 44947.260416666664 | 10.66 |
| 44947.270833333336 | 10.64 |
| 44947.28125 | 9.72 |
| 44947.291666666664 | 8.63 |
| 44947.302083333336 | 8.74 |
| 44947.3125 | 8.31 |
| 44947.322916666664 | 7.76 |
| 44947.333333333336 | 7.88 |
| 44947.34375 | 7.1 |
| 44947.354166666664 | 6.03 |
| 44947.364583333336 | 6.19 |
| 44947.375 | 5.92 |
| 44947.385416666664 | 4.74 |
| 44947.395833333336 | 4.26 |
| 44947.40625 | 4.12 |
| 44947.416666666664 | 4.69 |
| 44947.427083333336 | 4.82 |
| 44947.4375 | 4.9 |
| 44947.447916666664 | 5.18 |
| 44947.458333333336 | 5.4 |
| 44947.46875 | 5.68 |
| 44947.479166666664 | 4.78 |
| 44947.489583333336 | 5.21 |
| 44947.5 | 4.86 |
| 44947.510416666664 | 5.23 |
| 44947.520833333336 | 5.84 |
| 44947.53125 | 5.86 |
| 44947.541666666664 | 5.47 |
| 44947.552083333336 | 11.29 |
| 44947.5625 | 4.43 |
| 44947.572916666664 | 2.72 |
| 44947.583333333336 | 2.25 |
| 44947.59375 | 3.37 |
| 44947.604166666664 | 2.05 |
| 44947.614583333336 | 2.73 |
| 44947.625 | 1.75 |
| 44947.635416666664 | 2.9 |
| 44947.645833333336 | 2.02 |
| 44947.65625 | 1.71 |
| 44947.666666666664 | 1.21 |
| 44947.677083333336 | 107.3 |
| 44947.6875 | 349.58 |
| 44947.697916666664 | 118.65 |
| 44947.708333333336 | 2.18 |
| 44947.71875 | 2.35 |
| 44947.729166666664 | 2.48 |
| 44947.739583333336 | 2.67 |
| 44947.75 | 3.1 |
| 44947.760416666664 | 2.86 |
| 44947.770833333336 | 3.15 |
| 44947.78125 | 3.34 |
| 44947.791666666664 | 3.76 |
| 44947.802083333336 | 7.49 |
| 44947.8125 | 5.3 |
| 44947.822916666664 | 6.24 |
| 44947.833333333336 | 8.08 |
| 44947.84375 | 7.74 |
| 44947.854166666664 | 7.9 |
| 44947.864583333336 | 7.75 |
| 44947.875 | 7.45 |
| 44947.885416666664 | 5.92 |
| 44947.895833333336 | 5.44 |
| 44947.90625 | 5.54 |
| 44947.916666666664 | 4.29 |
| 44947.927083333336 | 3.86 |
| 44947.9375 | 3.78 |
| 44947.947916666664 | 4.38 |
| 44947.958333333336 | 4.27 |
| 44947.96875 | 5.2 |
| 44947.979166666664 | 5.95 |
| 44947.989583333336 | 6.23 |
| 44948.0 | 13.33 |
| 44948.010416666664 | 6.31 |
| 44948.020833333336 | 6.9 |
| 44948.03125 | 6.89 |
| 44948.041666666664 | 8.08 |
| 44948.052083333336 | 7.98 |
| 44948.0625 | 21.29 |
| 44948.072916666664 | 6.04 |
| 44948.083333333336 | 6.53 |
| 44948.09375 | 4.98 |
| 44948.104166666664 | 4.85 |
| 44948.114583333336 | 3.97 |
| 44948.125 | 3.56 |
| 44948.135416666664 | 4.07 |
| 44948.145833333336 | 3.89 |
| 44948.15625 | 3.23 |
| 44948.166666666664 | 520.87 |
| 44948.177083333336 | 520.94 |
| 44948.1875 | 6.18 |
| 44948.197916666664 | 3.79 |
| 44948.208333333336 | 3.72 |
| 44948.21875 | 3.76 |
| 44948.229166666664 | 4.15 |
| 44948.239583333336 | 4.08 |
| 44948.25 | 4.63 |
| 44948.260416666664 | 4.69 |
| 44948.270833333336 | 4.88 |
| 44948.28125 | 5.24 |
| 44948.291666666664 | 5.11 |
| 44948.302083333336 | 5.51 |
| 44948.3125 | 10.27 |
| 44948.322916666664 | 6.58 |
| 44948.333333333336 | 5.55 |
| 44948.34375 | 6.86 |
| 44948.354166666664 | 6.12 |
| 44948.364583333336 | 5.2 |
| 44948.375 | 4.58 |
| 44948.385416666664 | 4.64 |
| 44948.395833333336 | 4.14 |
| 44948.40625 | 4.66 |
| 44948.416666666664 | 3.75 |
| 44948.427083333336 | 3.45 |
| 44948.4375 | 3.95 |
| 44948.447916666664 | 3.71 |
| 44948.458333333336 | 3.46 |
| 44948.46875 | 3.73 |
| 44948.479166666664 | 4.05 |
| 44948.489583333336 | 4.61 |
| 44948.5 | 4.5 |
| 44948.510416666664 | 4.9 |
| 44948.520833333336 | 4.61 |
| 44948.53125 | 3.77 |
| 44948.541666666664 | 3.58 |
| 44948.552083333336 | 4.08 |
| 44948.5625 | 32.54 |
| 44948.572916666664 | 5.27 |
| 44948.583333333336 | 5.38 |
| 44948.59375 | 6.24 |
| 44948.604166666664 | 4.68 |
| 44948.614583333336 | 4.26 |
| 44948.625 | 3.43 |
| 44948.635416666664 | 4.2 |
| 44948.645833333336 | 3.77 |
| 44948.65625 | 3.5 |
| 44948.666666666664 | 3.29 |
| 44948.677083333336 | 3.25 |
| 44948.6875 | 3.11 |
| 44948.697916666664 | 3.34 |
| 44948.708333333336 | 2.93 |
| 44948.71875 | 3.35 |
| 44948.729166666664 | 3.28 |
| 44948.739583333336 | 3.76 |
| 44948.75 | 3.51 |
| 44948.760416666664 | 3.45 |
| 44948.770833333336 | 4.97 |
| 44948.78125 | 5.66 |
| 44948.791666666664 | 5.58 |
| 44948.802083333336 | 6.67 |
| 44948.8125 | 7.14 |
| 44948.822916666664 | 7.93 |
| 44948.833333333336 | 7.44 |
| 44948.84375 | 7.89 |
| 44948.854166666664 | 8.49 |
| 44948.864583333336 | 8.26 |
| 44948.875 | 7.43 |
| 44948.885416666664 | 7.9 |
| 44948.895833333336 | 7.84 |
| 44948.90625 | 7.26 |
| 44948.916666666664 | 7.39 |
| 44948.927083333336 | 5.9 |
| 44948.9375 | 5.91 |
| 44948.947916666664 | 4.56 |
| 44948.958333333336 | 5.25 |
| 44948.96875 | 4.96 |
| 44948.979166666664 | 4.73 |
| 44948.989583333336 | 4.88 |
| 44949.0 | 4.96 |
| 44949.010416666664 | 5.06 |
| 44949.020833333336 | 5.35 |
| 44949.03125 | 5.6 |
| 44949.041666666664 | 6.16 |
| 44949.052083333336 | 5.6 |
| 44949.0625 | 5.75 |
| 44949.072916666664 | 5.23 |
| 44949.083333333336 | 4.82 |
| 44949.09375 | 6.41 |
| 44949.104166666664 | 6.26 |
| 44949.114583333336 | 4.86 |
| 44949.125 | 4.04 |
| 44949.135416666664 | 4.17 |
| 44949.145833333336 | 4.19 |
| 44949.15625 | 3.44 |
| 44949.166666666664 | 3.67 |
| 44949.177083333336 | 4 |
| 44949.1875 | 4.01 |
| 44949.197916666664 | 3.48 |
| 44949.208333333336 | 3.62 |
| 44949.21875 | 3.34 |
| 44949.229166666664 | 3.87 |
| 44949.239583333336 | 8.22 |
| 44949.25 | 4.56 |
| 44949.260416666664 | 4.53 |
| 44949.270833333336 | 4.89 |
| 44949.28125 | 4.76 |
| 44949.291666666664 | 5 |
| 44949.302083333336 | 5.42 |
| 44949.3125 | 5.37 |
| 44949.322916666664 | 5.82 |
| 44949.333333333336 | 5.57 |
| 44949.34375 | 13.42 |
| 44949.354166666664 | 6.26 |
| 44949.364583333336 | 6.62 |
| 44949.375 | 6.79 |
| 44949.385416666664 | 7.17 |
| 44949.395833333336 | 6.72 |
| 44949.40625 | 5 |
| 44949.416666666664 | 5.77 |
| 44949.427083333336 | 4.44 |
| 44949.4375 | 3.85 |
| 44949.447916666664 | 3.73 |
| 44949.458333333336 | 3.49 |
| 44949.46875 | 3.93 |
| 44949.479166666664 | 3.32 |
| 44949.489583333336 | 3.29 |
| 44949.5 | 3.88 |
| 44949.510416666664 | 5.02 |
| 44949.520833333336 | 4.18 |
| 44949.53125 | 4.43 |
| 44949.541666666664 | 3.94 |
| 44949.552083333336 | 4.06 |
| 44949.5625 | 4.1 |
| 44949.572916666664 | 3.73 |
| 44949.583333333336 | 3.08 |
| 44949.59375 | 3.45 |
| 44949.604166666664 | 2.84 |
| 44949.614583333336 | 2.48 |
| 44949.625 | 3.37 |
| 44949.635416666664 | 3.41 |
| 44949.645833333336 | 2.04 |
| 44949.65625 | 2.36 |
| 44949.666666666664 | 1.54 |
| 44949.677083333336 | 1.63 |
| 44949.6875 | 1.07 |
| 44949.697916666664 | 1.59 |
| 44949.708333333336 | 1.65 |
| 44949.71875 | 0.71 |
| 44949.729166666664 | 1.79 |
| 44949.739583333336 | 86.21 |
| 44949.75 | 5.44 |
| 44949.760416666664 | 12.48 |
| 44949.770833333336 | 513.21 |
| 44949.78125 | 441.17 |
| 44949.791666666664 | 269.62 |
| 44949.802083333336 | 503.21 |
| 44949.8125 | 85 |
| 44949.822916666664 | 69.03 |
| 44949.833333333336 | 36.79 |
| 44949.84375 | 218 |
| 44949.854166666664 | 20.91 |
| 44949.864583333336 | 297.32 |
| 44949.875 | 12.92 |
| 44949.885416666664 | 6.74 |
| 44949.895833333336 | 6.65 |
| 44949.90625 | 6.65 |
| 44949.916666666664 | 6.71 |
| 44949.927083333336 | 6.77 |
| 44949.9375 | 6.67 |
| 44949.947916666664 | 6.82 |
| 44949.958333333336 | 5.98 |
| 44949.96875 | 5.14 |
| 44949.979166666664 | 5.42 |
| 44949.989583333336 | 5.49 |
| 44950.0 | 4.82 |
| 44950.010416666664 | 5.11 |
| 44950.020833333336 | 4.99 |
| 44950.03125 | 5.39 |
| 44950.041666666664 | 5.44 |
| 44950.052083333336 | 5.16 |
| 44950.0625 | 4.87 |
| 44950.072916666664 | 5.44 |
| 44950.083333333336 | 4.97 |
| 44950.09375 | 4.92 |
| 44950.104166666664 | 4.57 |
| 44950.114583333336 | 5.13 |
| 44950.125 | 5.12 |
| 44950.135416666664 | 5.04 |
| 44950.145833333336 | 4.83 |
| 44950.15625 | 3.98 |
| 44950.166666666664 | 3.63 |
| 44950.177083333336 | 3.9 |
| 44950.1875 | 3.88 |
| 44950.197916666664 | 3.52 |
| 44950.208333333336 | 3.5 |
| 44950.21875 | 3.62 |
| 44950.229166666664 | 3.7 |
| 44950.239583333336 | 521.12 |
| 44950.25 | 518.82 |
| 44950.260416666664 | 72.36 |
| 44950.270833333336 | 4.84 |
| 44950.28125 | 5.16 |
| 44950.291666666664 | 4.47 |
| 44950.302083333336 | 4.47 |
| 44950.3125 | 4.69 |
| 44950.322916666664 | 4.63 |
| 44950.333333333336 | 4.95 |
| 44950.34375 | 4.77 |
| 44950.354166666664 | 5.13 |
| 44950.364583333336 | 4.71 |
| 44950.375 | 4.91 |
| 44950.385416666664 | 5.05 |
| 44950.395833333336 | 6.15 |
| 44950.40625 | 5.71 |
| 44950.416666666664 | 5.56 |
| 44950.427083333336 | 5.65 |
| 44950.4375 | 6.62 |
| 44950.447916666664 | 5.34 |
| 44950.458333333336 | 5.3 |
| 44950.46875 | 4.62 |
| 44950.479166666664 | 4.22 |
| 44950.489583333336 | 4.25 |
| 44950.5 | 5.11 |
| 44950.510416666664 | 4.83 |
| 44950.520833333336 | 4.12 |
| 44950.53125 | 4.09 |
| 44950.541666666664 | 3.6 |
| 44950.552083333336 | 2.8 |
| 44950.5625 | 2.28 |
| 44950.572916666664 | 2.85 |
| 44950.583333333336 | 1.99 |
| 44950.59375 | 1.87 |
| 44950.604166666664 | 1.18 |
| 44950.614583333336 | 1.29 |
| 44950.625 | 1.03 |
| 44950.635416666664 | 1.22 |
| 44950.645833333336 | 1.3 |
| 44950.65625 | 1 |
| 44950.666666666664 | 1.03 |
| 44950.677083333336 | 0.93 |
| 44950.6875 | 1.02 |
| 44950.697916666664 | 1.12 |
| 44950.708333333336 | 0.97 |
| 44950.71875 | 1.24 |
| 44950.729166666664 | 2.12 |
| 44950.739583333336 | 2.23 |
| 44950.75 | 1.56 |
| 44950.760416666664 | 2.63 |
| 44950.770833333336 | 5.47 |
| 44950.78125 | 1.92 |
| 44950.791666666664 | 2.26 |
| 44950.802083333336 | 449.55 |
| 44950.8125 | 85.53 |
| 44950.822916666664 | 2.41 |
| 44950.833333333336 | 2.72 |
| 44950.84375 | 2.8 |
| 44950.854166666664 | 4.68 |
| 44950.864583333336 | 5.21 |
| 44950.875 | 4.26 |
| 44950.885416666664 | 4.6 |
| 44950.895833333336 | 4.79 |
| 44950.90625 | 4.75 |
| 44950.916666666664 | 5.75 |
| 44950.927083333336 | 4.6 |
| 44950.9375 | 4.98 |
| 44950.947916666664 | 5.26 |
| 44950.958333333336 | 6.37 |
| 44950.96875 | 6.29 |
| 44950.979166666664 | 11.52 |
| 44950.989583333336 | 7.05 |
| 44951.0 | 5.41 |
| 44951.010416666664 | 4.55 |
| 44951.020833333336 | 4.33 |
| 44951.03125 | 3.91 |
| 44951.041666666664 | 3.45 |
| 44951.052083333336 | 3.04 |
| 44951.0625 | 3.66 |
| 44951.072916666664 | 2.99 |
| 44951.083333333336 | 3.19 |
| 44951.09375 | 3.49 |
| 44951.104166666664 | 3.32 |
| 44951.114583333336 | 3.69 |
| 44951.125 | 3.74 |
| 44951.135416666664 | 3.54 |
| 44951.145833333336 | 3.95 |
| 44951.15625 | 3.47 |
| 44951.166666666664 | 4.27 |
| 44951.177083333336 | 4.61 |
| 44951.1875 | 3.02 |
| 44951.197916666664 | 3.12 |
| 44951.208333333336 | 3.09 |
| 44951.21875 | 3.07 |
| 44951.229166666664 | 2.82 |
| 44951.239583333336 | 2.84 |
| 44951.25 | 2.65 |
| 44951.260416666664 | 18.35 |
| 44951.270833333336 | 3.36 |
| 44951.28125 | 2.96 |
| 44951.291666666664 | 3.23 |
| 44951.302083333336 | 3.32 |
| 44951.3125 | 3.6 |
| 44951.322916666664 | 3.44 |
| 44951.333333333336 | 3.83 |
| 44951.34375 | 4.01 |
| 44951.354166666664 | 3.93 |
| 44951.364583333336 | 3.81 |
| 44951.375 | 3.77 |
| 44951.385416666664 | 3.69 |
| 44951.395833333336 | 4.43 |
| 44951.40625 | 4.07 |
| 44951.416666666664 | 4.83 |
| 44951.427083333336 | 5.21 |
| 44951.4375 | 4.61 |
| 44951.447916666664 | 9.73 |
| 44951.458333333336 | 4.6 |
| 44951.46875 | 4.52 |
| 44951.479166666664 | 4.34 |
| 44951.489583333336 | 4.59 |
| 44951.5 | 4.42 |
| 44951.510416666664 | 4.2 |
| 44951.520833333336 | 3.67 |
| 44951.53125 | 3.99 |
| 44951.541666666664 | 2.9 |
| 44951.552083333336 | 3.1 |
| 44951.5625 | 2.36 |
| 44951.572916666664 | 2.36 |
| 44951.583333333336 | 2.33 |
| 44951.59375 | 2.22 |
| 44951.604166666664 | 2.08 |
| 44951.614583333336 | 2.02 |
| 44951.625 | 3.53 |
| 44951.635416666664 | 2.63 |
| 44951.645833333336 | 2.92 |
| 44951.65625 | 2.54 |
| 44951.666666666664 | 2.64 |
| 44951.677083333336 | 2.53 |
| 44951.6875 | 2.43 |
| 44951.697916666664 | 2.37 |
| 44951.708333333336 | 2.87 |
| 44951.71875 | 2.67 |
| 44951.729166666664 | 2.62 |
| 44951.739583333336 | 2.78 |
| 44951.75 | 2.63 |
| 44951.760416666664 | 3.1 |
| 44951.770833333336 | 2.86 |
| 44951.78125 | 2.61 |
| 44951.791666666664 | 2.76 |
| 44951.802083333336 | 2.66 |
| 44951.8125 | 2.91 |
| 44951.822916666664 | 498.9 |
| 44951.833333333336 | 81.92 |
| 44951.84375 | 3.36 |
| 44951.854166666664 | 3.79 |
| 44951.864583333336 | 4.09 |
| 44951.875 | 4.24 |
| 44951.885416666664 | 5.06 |
| 44951.895833333336 | 4.83 |
| 44951.90625 | 5.19 |
| 44951.916666666664 | 5.46 |
| 44951.927083333336 | 5.75 |
| 44951.9375 | 5.75 |
| 44951.947916666664 | 6.39 |
| 44951.958333333336 | 5.82 |
| 44951.96875 | 5.78 |
| 44951.979166666664 | 5.24 |
| 44951.989583333336 | 5.44 |
| 44952.0 | 5.39 |
| 44952.010416666664 | 6.39 |
| 44952.020833333336 | 7.16 |
| 44952.03125 | 9.64 |
| 44952.041666666664 | 8.9 |
| 44952.052083333336 | 6.75 |
| 44952.0625 | 9.16 |
| 44952.072916666664 | 8.06 |
| 44952.083333333336 | 8.05 |
| 44952.09375 | 8.28 |
| 44952.104166666664 | 7.5 |
| 44952.114583333336 | 284.91 |
| 44952.125 | 5.99 |
| 44952.135416666664 | 7.2 |
| 44952.145833333336 | 14.45 |
| 44952.15625 | 505.14 |
| 44952.166666666664 | 497.15 |
| 44952.177083333336 | 6.17 |
| 44952.1875 | 5 |
| 44952.197916666664 | 6.48 |
| 44952.208333333336 | 8.05 |
| 44952.21875 | 6.12 |
| 44952.229166666664 | 5.4 |
| 44952.239583333336 | 4.05 |
| 44952.25 | 4.6 |
| 44952.260416666664 | 4.03 |
| 44952.270833333336 | 3.88 |
| 44952.28125 | 4.02 |
| 44952.291666666664 | 4.05 |
| 44952.302083333336 | 4.2 |
| 44952.3125 | 4.18 |
| 44952.322916666664 | 4.63 |
| 44952.333333333336 | 4.65 |
| 44952.34375 | 5.16 |
| 44952.354166666664 | 5.79 |
| 44952.364583333336 | 5.99 |
| 44952.375 | 6.43 |
| 44952.385416666664 | 6.53 |
| 44952.395833333336 | 6.65 |
| 44952.40625 | 6.58 |
| 44952.416666666664 | 6.32 |
| 44952.427083333336 | 6.25 |
| 44952.4375 | 5.78 |
| 44952.447916666664 | 5.62 |
| 44952.458333333336 | 5.58 |
| 44952.46875 | 5.61 |
| 44952.479166666664 | 6 |
| 44952.489583333336 | 6.35 |
| 44952.5 | 6.67 |
| 44952.510416666664 | 6.74 |
| 44952.520833333336 | 6.79 |
| 44952.53125 | 6.72 |
| 44952.541666666664 | 5.51 |
| 44952.552083333336 | 4.78 |
| 44952.5625 | 4.67 |
| 44952.572916666664 | 3.95 |
| 44952.583333333336 | 3.77 |
| 44952.59375 | 3.13 |
| 44952.604166666664 | 2.85 |
| 44952.614583333336 | 2.53 |
| 44952.625 | 2.13 |
| 44952.635416666664 | 2.18 |
| 44952.645833333336 | 2.4 |
| 44952.65625 | 2.29 |
| 44952.666666666664 | 1.21 |
| 44952.677083333336 | 1.59 |
| 44952.6875 | 1.38 |
| 44952.697916666664 | 1.38 |
| 44952.708333333336 | 1 |
| 44952.71875 | 1.75 |
| 44952.729166666664 | 1.68 |
| 44952.739583333336 | 2.42 |
| 44952.75 | 2.22 |
| 44952.760416666664 | 1.66 |
| 44952.770833333336 | 1.84 |
| 44952.78125 | 1.02 |
| 44952.791666666664 | 2.21 |
| 44952.802083333336 | 2.33 |
| 44952.8125 | 1.88 |
| 44952.822916666664 | 2.35 |
| 44952.833333333336 | 3.25 |
| 44952.84375 | 3.69 |
| 44952.854166666664 | 4.84 |
| 44952.864583333336 | 5.01 |
| 44952.875 | 5.14 |
| 44952.885416666664 | 5.61 |
| 44952.895833333336 | 5.7 |
| 44952.90625 | 5.45 |
| 44952.916666666664 | 5.29 |
| 44952.927083333336 | 4.96 |
| 44952.9375 | 5.26 |
| 44952.947916666664 | 5.87 |
| 44952.958333333336 | 7.83 |
| 44952.96875 | 6.14 |
| 44952.979166666664 | 6.78 |
| 44952.989583333336 | 6.86 |
| 44953.0 | 6.37 |
| 44953.010416666664 | 6.8 |
| 44953.020833333336 | 6.48 |
| 44953.03125 | 9.43 |
| 44953.041666666664 | 6.01 |
| 44953.052083333336 | 5.53 |
| 44953.0625 | 5.4 |
| 44953.072916666664 | 5.31 |
| 44953.083333333336 | 4.89 |
| 44953.09375 | 5.27 |
| 44953.104166666664 | 3.86 |
| 44953.114583333336 | 4.14 |
| 44953.125 | 3.38 |
| 44953.135416666664 | 3.04 |
| 44953.145833333336 | 3.1 |
| 44953.15625 | 2.93 |
| 44953.166666666664 | 3.15 |
| 44953.177083333336 | 3.32 |
| 44953.1875 | 3.53 |
| 44953.197916666664 | 3.19 |
| 44953.208333333336 | 3.85 |
| 44953.21875 | 4.43 |
| 44953.229166666664 | 3.48 |
| 44953.239583333336 | 3.29 |
| 44953.25 | 2.82 |
| 44953.260416666664 | 3.52 |
| 44953.270833333336 | 3.1 |
| 44953.28125 | 2.94 |
| 44953.291666666664 | 2.91 |
| 44953.302083333336 | 2.84 |
| 44953.3125 | 2.89 |
| 44953.322916666664 | 2.6 |
| 44953.333333333336 | 2.71 |
| 44953.34375 | 2.84 |
| 44953.354166666664 | 3.54 |
| 44953.364583333336 | 3.31 |
| 44953.375 | 3.47 |
| 44953.385416666664 | 3.91 |
| 44953.395833333336 | 3.82 |
| 44953.40625 | 4.04 |
| 44953.416666666664 | 4.18 |
| 44953.427083333336 | 4.45 |
| 44953.4375 | 4.84 |
| 44953.447916666664 | 5.34 |
| 44953.458333333336 | 5.11 |
| 44953.46875 | 5.44 |
| 44953.479166666664 | 5.72 |
| 44953.489583333336 | 5.85 |
| 44953.5 | 6.06 |
| 44953.510416666664 | 7.4 |
| 44953.520833333336 | 8.05 |
| 44953.53125 | 6.57 |
| 44953.541666666664 | 6.68 |
| 44953.552083333336 | 6.38 |
| 44953.5625 | 6.07 |
| 44953.572916666664 | 5.14 |
| 44953.583333333336 | 4.67 |
| 44953.59375 | 3.88 |
| 44953.604166666664 | 3.27 |
| 44953.614583333336 | 2.41 |
| 44953.625 | 1.72 |
| 44953.635416666664 | 1.43 |
| 44953.645833333336 | 1.06 |
| 44953.65625 | 0.89 |
| 44953.666666666664 | 0.89 |
| 44953.677083333336 | 0.66 |
| 44953.6875 | 0.73 |
| 44953.697916666664 | 0.5 |
| 44953.708333333336 | 0.63 |
| 44953.71875 | 1.06 |
| 44953.729166666664 | 0.76 |
| 44953.739583333336 | 0.94 |
| 44953.75 | 0.88 |
| 44953.760416666664 | 1.3 |
| 44953.770833333336 | 1.97 |
| 44953.78125 | 1.32 |
| 44953.791666666664 | 1.01 |
| 44953.802083333336 | 1.57 |
| 44953.8125 | 0.93 |
| 44953.822916666664 | 0.84 |
| 44953.833333333336 | 1.27 |
| 44953.84375 | 1.25 |
| 44953.854166666664 | 1.67 |
| 44953.864583333336 | 3.05 |
| 44953.875 | 3.72 |
| 44953.885416666664 | 4.62 |
| 44953.895833333336 | 4.52 |
| 44953.90625 | 5.01 |
| 44953.916666666664 | 4.84 |
| 44953.927083333336 | 4.89 |
| 44953.9375 | 5.29 |
| 44953.947916666664 | 5.56 |
| 44953.958333333336 | 6.07 |
| 44953.96875 | 5.8 |
| 44953.979166666664 | 5.89 |
| 44953.989583333336 | 5.96 |
| 44954.0 | 5.36 |
| 44954.010416666664 | 7.04 |
| 44954.020833333336 | 6.59 |
| 44954.03125 | 7.01 |
| 44954.041666666664 | 7.36 |
| 44954.052083333336 | 7.03 |
| 44954.0625 | 7.44 |
| 44954.072916666664 | 6.19 |
| 44954.083333333336 | 5.49 |
| 44954.09375 | 6.37 |
| 44954.104166666664 | 5.67 |
| 44954.114583333336 | 4.08 |
| 44954.125 | 3.42 |
| 44954.135416666664 | 3.54 |
| 44954.145833333336 | 3.15 |
| 44954.15625 | 2.84 |
| 44954.166666666664 | 2.49 |
| 44954.177083333336 | 1.85 |
| 44954.1875 | 1.47 |
| 44954.197916666664 | 1.41 |
| 44954.208333333336 | 2.1 |
| 44954.21875 | 2.07 |
| 44954.229166666664 | 2.24 |
| 44954.239583333336 | 2.57 |
| 44954.25 | 2.91 |
| 44954.260416666664 | 2.96 |
| 44954.270833333336 | 3.78 |
| 44954.28125 | 2.51 |
| 44954.291666666664 | 3.15 |
| 44954.302083333336 | 2.04 |
| 44954.3125 | 2.23 |
| 44954.322916666664 | 2.04 |
| 44954.333333333336 | 2.19 |
| 44954.34375 | 2.19 |
| 44954.354166666664 | 2.14 |
| 44954.364583333336 | 4.12 |
| 44954.375 | 4.98 |
| 44954.385416666664 | 4.98 |
| 44954.395833333336 | 7.49 |
| 44954.40625 | 2.79 |
| 44954.416666666664 | 2.97 |
| 44954.427083333336 | 3.28 |
| 44954.4375 | 3.47 |
| 44954.447916666664 | 3.51 |
| 44954.458333333336 | 3.8 |
| 44954.46875 | 3.9 |
| 44954.479166666664 | 3.84 |
| 44954.489583333336 | 4.3 |
| 44954.5 | 4.09 |
| 44954.510416666664 | 4.62 |
| 44954.520833333336 | 4.61 |
| 44954.53125 | 4.85 |
| 44954.541666666664 | 4.91 |
| 44954.552083333336 | 4.92 |
| 44954.5625 | 4.94 |
| 44954.572916666664 | 4.57 |
| 44954.583333333336 | 3.47 |
| 44954.59375 | 3.01 |
| 44954.604166666664 | 2.45 |
| 44954.614583333336 | 2.33 |
| 44954.625 | 2.28 |
| 44954.635416666664 | 1.66 |
| 44954.645833333336 | 1.04 |
| 44954.65625 | 1.1 |
| 44954.666666666664 | 1.15 |
| 44954.677083333336 | 0.95 |
| 44954.6875 | 0.79 |
| 44954.697916666664 | 0.57 |
| 44954.708333333336 | 0.46 |
| 44954.71875 | 0.5 |
| 44954.729166666664 | 0.29 |
| 44954.739583333336 | 0.64 |
| 44954.75 | 0.51 |
| 44954.760416666664 | 0.35 |
| 44954.770833333336 | 0.55 |
| 44954.78125 | 0.63 |
| 44954.791666666664 | 1.07 |
| 44954.802083333336 | 1.33 |
| 44954.8125 | 1.01 |
| 44954.822916666664 | 1.38 |
| 44954.833333333336 | 1.36 |
| 44954.84375 | 0.89 |
| 44954.854166666664 | 1.03 |
| 44954.864583333336 | 1.48 |
| 44954.875 | 1.84 |
| 44954.885416666664 | 2.19 |
| 44954.895833333336 | 2.82 |
| 44954.90625 | 3.22 |
| 44954.916666666664 | 3.43 |
| 44954.927083333336 | 3.73 |
| 44954.9375 | 3.9 |
| 44954.947916666664 | 3.64 |
| 44954.958333333336 | 3.78 |
| 44954.96875 | 4.21 |
| 44954.979166666664 | 4.36 |
| 44954.989583333336 | 4.45 |
| 44955.0 | 4.89 |
| 44955.010416666664 | 5.31 |
| 44955.020833333336 | 5.56 |
| 44955.03125 | 6.34 |
| 44955.041666666664 | 6.98 |
| 44955.052083333336 | 8.3 |
| 44955.0625 | 5.94 |
| 44955.072916666664 | 5.78 |
| 44955.083333333336 | 6.34 |
| 44955.09375 | 5.97 |
| 44955.104166666664 | 5.79 |
| 44955.114583333336 | 4.41 |
| 44955.125 | 4 |
| 44955.135416666664 | 3.69 |
| 44955.145833333336 | 2.97 |
| 44955.15625 | 3.06 |
| 44955.166666666664 | 2.81 |
| 44955.177083333336 | 2.08 |
| 44955.1875 | 1.59 |
| 44955.197916666664 | 1.55 |
| 44955.208333333336 | 5.18 |
| 44955.21875 | 1.41 |
| 44955.229166666664 | 1.29 |
| 44955.239583333336 | 1.33 |
| 44955.25 | 2.25 |
| 44955.260416666664 | 1.55 |
| 44955.270833333336 | 2.39 |
| 44955.28125 | 1.96 |
| 44955.291666666664 | 1.96 |
| 44955.302083333336 | 2.72 |
| 44955.3125 | 1.7 |
| 44955.322916666664 | 2.15 |
| 44955.333333333336 | 2.21 |
| 44955.34375 | 1.57 |
| 44955.354166666664 | 1.49 |
| 44955.364583333336 | 1.69 |
| 44955.375 | 1.73 |
| 44955.385416666664 | 1.7 |
| 44955.395833333336 | 1.6 |
| 44955.40625 | 1.91 |
| 44955.416666666664 | 1.58 |
| 44955.427083333336 | 1.65 |
| 44955.4375 | 1.6 |
| 44955.447916666664 | 1.66 |
| 44955.458333333336 | 2.01 |
| 44955.46875 | 2.36 |
| 44955.479166666664 | 2.22 |
| 44955.489583333336 | 2.52 |
| 44955.5 | 2.94 |
| 44955.510416666664 | 3.1 |
| 44955.520833333336 | 3.23 |
| 44955.53125 | 3.73 |
| 44955.541666666664 | 4.15 |
| 44955.552083333336 | 4 |
| 44955.5625 | 4.52 |
| 44955.572916666664 | 4.11 |
| 44955.583333333336 | 4.24 |
| 44955.59375 | 2.89 |
| 44955.604166666664 | 2.48 |
| 44955.614583333336 | 2.17 |
| 44955.625 | 2.02 |
| 44955.635416666664 | 1.97 |
| 44955.645833333336 | 2.1 |
| 44955.65625 | 1.08 |
| 44955.666666666664 | 1.72 |
| 44955.677083333336 | 0.61 |
| 44955.6875 | 0.69 |
| 44955.697916666664 | 0.81 |
| 44955.708333333336 | 0.85 |
| 44955.71875 | 0.93 |
| 44955.729166666664 | 0.68 |
| 44955.739583333336 | 0.97 |
| 44955.75 | 1.14 |
| 44955.760416666664 | 1.31 |
| 44955.770833333336 | 1.36 |
| 44955.78125 | 1.37 |
| 44955.791666666664 | 1.07 |
| 44955.802083333336 | 1.49 |
| 44955.8125 | 1.26 |
| 44955.822916666664 | 1.67 |
| 44955.833333333336 | 1.77 |
| 44955.84375 | 1.83 |
| 44955.854166666664 | 1.62 |
| 44955.864583333336 | 1.39 |
| 44955.875 | 1.73 |
| 44955.885416666664 | 1.6 |
| 44955.895833333336 | 1.62 |
| 44955.90625 | 1.76 |
| 44955.916666666664 | 2.28 |
| 44955.927083333336 | 1.68 |
| 44955.9375 | 1.69 |
| 44955.947916666664 | 1.9 |
| 44955.958333333336 | 2.49 |
| 44955.96875 | 2.25 |
| 44955.979166666664 | 2.72 |
| 44955.989583333336 | 2.56 |
| 44956.0 | 3.26 |
| 44956.010416666664 | 3.38 |
| 44956.020833333336 | 3.64 |
| 44956.03125 | 3.81 |
| 44956.041666666664 | 4.14 |
| 44956.052083333336 | 4.79 |
| 44956.0625 | 4.7 |
| 44956.072916666664 | 5.49 |
| 44956.083333333336 | 7.4 |
| 44956.09375 | 4.84 |
| 44956.104166666664 | 5.47 |
| 44956.114583333336 | 5.17 |
| 44956.125 | 4.35 |
| 44956.135416666664 | 4.53 |
| 44956.145833333336 | 3.58 |
| 44956.15625 | 3.19 |
| 44956.166666666664 | 3.09 |
| 44956.177083333336 | 2.54 |
| 44956.1875 | 2.2 |
| 44956.197916666664 | 2.01 |
| 44956.208333333336 | 1.7 |
| 44956.21875 | 1.32 |
| 44956.229166666664 | 1.47 |
| 44956.239583333336 | 1.21 |
| 44956.25 | 1.21 |
| 44956.260416666664 | 1.18 |
| 44956.270833333336 | 1.15 |
| 44956.28125 | 1.35 |
| 44956.291666666664 | 1.49 |
| 44956.302083333336 | 1.65 |
| 44956.3125 | 2.4 |
| 44956.322916666664 | 1.74 |
| 44956.333333333336 | 1.61 |
| 44956.34375 | 3.04 |
| 44956.354166666664 | 2.79 |
| 44956.364583333336 | 2.18 |
| 44956.375 | 2.29 |
| 44956.385416666664 | 2.17 |
| 44956.395833333336 | 2.32 |
| 44956.40625 | 1.87 |
| 44956.416666666664 | 1.56 |
| 44956.427083333336 | 1.49 |
| 44956.4375 | 1.42 |
| 44956.447916666664 | 1.33 |
| 44956.458333333336 | 1.58 |
| 44956.46875 | 1.79 |
| 44956.479166666664 | 1.25 |
| 44956.489583333336 | 1.28 |
| 44956.5 | 1.67 |
| 44956.510416666664 | 1.49 |
| 44956.520833333336 | 1.78 |
| 44956.53125 | 2.1 |
| 44956.541666666664 | 2.11 |
| 44956.552083333336 | 2.86 |
| 44956.5625 | 3.15 |
| 44956.572916666664 | 2.92 |
| 44956.583333333336 | 3.27 |
| 44956.59375 | 3.44 |
| 44956.604166666664 | 4.21 |
| 44956.614583333336 | 4.51 |
| 44956.625 | 3.87 |
| 44956.635416666664 | 3.64 |
| 44956.645833333336 | 4.54 |
| 44956.65625 | 5.2 |
| 44956.666666666664 | 3.81 |
| 44956.677083333336 | 3.76 |
| 44956.6875 | 2.93 |
| 44956.697916666664 | 3.28 |
| 44956.708333333336 | 2.43 |
| 44956.71875 | 1.93 |
| 44956.729166666664 | 1.95 |
| 44956.739583333336 | 0.89 |
| 44956.75 | 1.19 |
| 44956.760416666664 | 1.03 |
| 44956.770833333336 | 1.03 |
| 44956.78125 | 0.94 |
| 44956.791666666664 | 1.01 |
| 44956.802083333336 | 1.03 |
| 44956.8125 | 1.15 |
| 44956.822916666664 | 1.64 |
| 44956.833333333336 | 1.03 |
| 44956.84375 | 1.7 |
| 44956.854166666664 | 2 |
| 44956.864583333336 | 2.1 |
| 44956.875 | 1.91 |
| 44956.885416666664 | 1.84 |
| 44956.895833333336 | 1.82 |
| 44956.90625 | 1.67 |
| 44956.916666666664 | 1.79 |
| 44956.927083333336 | 1.88 |
| 44956.9375 | 2.11 |
| 44956.947916666664 | 2.16 |
| 44956.958333333336 | 2.03 |
| 44956.96875 | 2.35 |
| 44956.979166666664 | 2.18 |
| 44956.989583333336 | 1.86 |
| 44957.0 | 2.14 |
| 44957.010416666664 | 2.94 |
| 44957.020833333336 | 3.16 |
| 44957.03125 | 3.4 |
| 44957.041666666664 | 4.43 |
| 44957.052083333336 | 5.19 |
| 44957.0625 | 5.56 |
| 44957.072916666664 | 5.77 |
| 44957.083333333336 | 6.24 |
| 44957.09375 | 6.93 |
| 44957.104166666664 | 9.57 |
| 44957.114583333336 | 6.84 |
| 44957.125 | 7.57 |
| 44957.135416666664 | 6.95 |
| 44957.145833333336 | 6.73 |
| 44957.15625 | 6.88 |
| 44957.166666666664 | 5.85 |
| 44957.177083333336 | 4.38 |
| 44957.1875 | 3.72 |
| 44957.197916666664 | 3.5 |
| 44957.208333333336 | 3.15 |
| 44957.21875 | 2.5 |
| 44957.229166666664 | 2.05 |
| 44957.239583333336 | 2.16 |
| 44957.25 | 2.25 |
| 44957.260416666664 | 1.78 |
| 44957.270833333336 | 2.12 |
| 44957.28125 | 1.52 |
| 44957.291666666664 | 1.36 |
| 44957.302083333336 | 1.39 |
| 44957.3125 | 1.28 |
| 44957.322916666664 | 1.75 |
| 44957.333333333336 | 1.35 |
| 44957.34375 | 1.7 |
| 44957.354166666664 | 1.45 |
| 44957.364583333336 | 1.6 |
| 44957.375 | 1.67 |
| 44957.385416666664 | 1.75 |
| 44957.395833333336 | 1.99 |
| 44957.40625 | 1.76 |
| 44957.416666666664 | 2.63 |
| 44957.427083333336 | 1.65 |
| 44957.4375 | 1.71 |
| 44957.447916666664 | 2.3 |
| 44957.458333333336 | 1.35 |
| 44957.46875 | 1.66 |
| 44957.479166666664 | 1.76 |
| 44957.489583333336 | 1.77 |
| 44957.5 | 1.53 |
| 44957.510416666664 | 1.25 |
| 44957.520833333336 | 1.53 |
| 44957.53125 | 1.32 |
| 44957.541666666664 | 1.53 |
| 44957.552083333336 | 1.98 |
| 44957.5625 | 2.4 |
| 44957.572916666664 | 2.78 |
| 44957.583333333336 | 3.3 |
| 44957.59375 | 3.99 |
| 44957.604166666664 | 3.97 |
| 44957.614583333336 | 4.72 |
| 44957.625 | 4.64 |
| 44957.635416666664 | 5.26 |
| 44957.645833333336 | 5.01 |
| 44957.65625 | 5.73 |
| 44957.666666666664 | 6.34 |
| 44957.677083333336 | 6.73 |
| 44957.6875 | 8.49 |
| 44957.697916666664 | 8.89 |
| 44957.708333333336 | 6.01 |
| 44957.71875 | 15.69 |
| 44957.729166666664 | 3.7 |
| 44957.739583333336 | 4.3 |
| 44957.75 | 2.95 |
| 44957.760416666664 | 3.74 |
| 44957.770833333336 | 4.51 |
| 44957.78125 | 4.53 |
| 44957.791666666664 | 3.01 |
| 44957.802083333336 | 2.79 |
| 44957.8125 | 2.41 |
| 44957.822916666664 | 2.28 |
| 44957.833333333336 | 1.91 |
| 44957.84375 | 2.15 |
| 44957.854166666664 | 1.88 |
| 44957.864583333336 | 1.8 |
| 44957.875 | 1.54 |
| 44957.885416666664 | 1.87 |
| 44957.895833333336 | 1.91 |
| 44957.90625 | 1.95 |
| 44957.916666666664 | 1.93 |
| 44957.927083333336 | 1.94 |
| 44957.9375 | 2.22 |
| 44957.947916666664 | 1.92 |
| 44957.958333333336 | 2.13 |
| 44957.96875 | 2.3 |
| 44957.979166666664 | 2.39 |
| 44957.989583333336 | 2.77 |
| 44958.0 | 2.96 |
| 44958.010416666664 | 3.05 |
| 44958.020833333336 | 3.12 |
| 44958.03125 | 3.52 |
| 44958.041666666664 | 5.06 |
| 44958.052083333336 | 4.84 |
| 44958.0625 | 5.35 |
| 44958.072916666664 | 6.26 |
| 44958.083333333336 | 6.1 |
| 44958.09375 | 6.03 |
| 44958.104166666664 | 6.57 |
| 44958.114583333336 | 6.88 |
| 44958.125 | 7.37 |
| 44958.135416666664 | 7.54 |
| 44958.145833333336 | 7.56 |